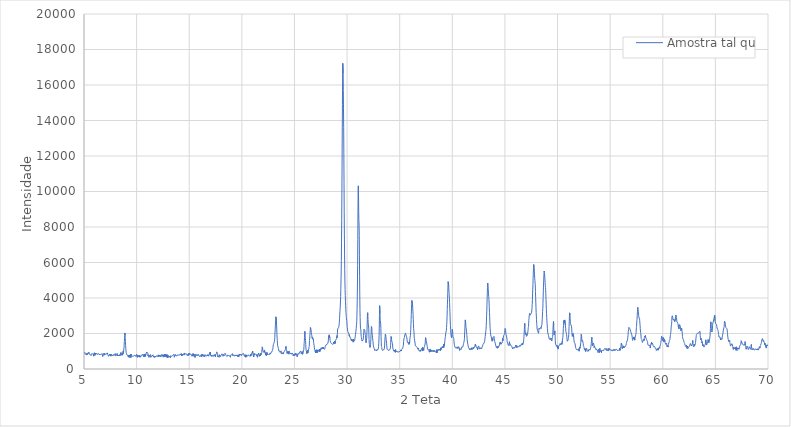
| Category | Amostra tal qual  |
|---|---|
| 2.00071892 | 3446.738 |
| 2.01771892 | 3473.504 |
| 2.03471892 | 3361.648 |
| 2.05171892 | 3457.384 |
| 2.06871892 | 3377.468 |
| 2.08571892 | 3362.294 |
| 2.10271892 | 3392.983 |
| 2.11971892 | 3262.413 |
| 2.13671892 | 3332.459 |
| 2.15371892 | 3360.539 |
| 2.17071892 | 3289.483 |
| 2.18771892 | 3294.757 |
| 2.20471892 | 3306.055 |
| 2.22171892 | 3299.937 |
| 2.23871892 | 3320.487 |
| 2.25571892 | 3243.116 |
| 2.27271892 | 3268.101 |
| 2.28971892 | 3289.063 |
| 2.30671892 | 3279.202 |
| 2.32371892 | 3238.842 |
| 2.34071892 | 3213.155 |
| 2.35771892 | 3211.542 |
| 2.37471892 | 3142.597 |
| 2.39171892 | 3151.229 |
| 2.40871892 | 3247.364 |
| 2.42571892 | 3241.54 |
| 2.44271892 | 3160.416 |
| 2.45971892 | 3089.484 |
| 2.47671892 | 3081.322 |
| 2.49371892 | 3093.118 |
| 2.51071892 | 3058.055 |
| 2.52771892 | 3018.761 |
| 2.54471892 | 3102.33 |
| 2.56171892 | 3078.498 |
| 2.57871892 | 3039.859 |
| 2.59571892 | 3004.997 |
| 2.61271892 | 2956.349 |
| 2.62971892 | 2957.309 |
| 2.64671892 | 2967.222 |
| 2.66371892 | 2911.367 |
| 2.68071892 | 2879.38 |
| 2.69771892 | 2926.047 |
| 2.71471892 | 2830.583 |
| 2.73171892 | 2797.06 |
| 2.74871892 | 2886.039 |
| 2.76571892 | 2718.343 |
| 2.78271892 | 2812.035 |
| 2.79971892 | 2791.457 |
| 2.81671892 | 2711.192 |
| 2.83371892 | 2725.256 |
| 2.85071892 | 2616.702 |
| 2.86771892 | 2642.447 |
| 2.88471892 | 2576.996 |
| 2.90171892 | 2525.166 |
| 2.91871892 | 2532.669 |
| 2.93571892 | 2469.244 |
| 2.95271892 | 2494.887 |
| 2.96971892 | 2457.457 |
| 2.98671892 | 2372.251 |
| 3.00371892 | 2308.032 |
| 3.02071892 | 2289.84 |
| 3.03771892 | 2283.734 |
| 3.05471892 | 2214.18 |
| 3.07171892 | 2116.393 |
| 3.08871892 | 2072.455 |
| 3.10571892 | 2058.463 |
| 3.12271892 | 1905.633 |
| 3.13971892 | 1860.612 |
| 3.15671892 | 1861.411 |
| 3.17371892 | 1893.253 |
| 3.19071892 | 1799.585 |
| 3.20771892 | 1719.695 |
| 3.22471892 | 1781.858 |
| 3.24171892 | 1728.142 |
| 3.25871892 | 1622.046 |
| 3.27571892 | 1722.921 |
| 3.29271892 | 1656.152 |
| 3.30971892 | 1688.199 |
| 3.32671892 | 1601.05 |
| 3.34371892 | 1553.948 |
| 3.36071892 | 1642.398 |
| 3.37771892 | 1640.225 |
| 3.39471892 | 1617.008 |
| 3.41171892 | 1618.382 |
| 3.42871892 | 1604.823 |
| 3.44571892 | 1553.759 |
| 3.46271892 | 1575.585 |
| 3.47971892 | 1619.36 |
| 3.49671892 | 1637.564 |
| 3.51371892 | 1630.763 |
| 3.53071892 | 1586.431 |
| 3.54771892 | 1594.211 |
| 3.56471892 | 1548.388 |
| 3.58171892 | 1483.349 |
| 3.59871892 | 1505.972 |
| 3.61571892 | 1525.682 |
| 3.63271892 | 1544.296 |
| 3.64971892 | 1598.179 |
| 3.66671892 | 1556.754 |
| 3.68371892 | 1529.047 |
| 3.70071892 | 1532.015 |
| 3.71771892 | 1501.546 |
| 3.73471892 | 1580.19 |
| 3.75171892 | 1607.742 |
| 3.76871892 | 1499.635 |
| 3.78571892 | 1511.165 |
| 3.80271892 | 1579.337 |
| 3.81971892 | 1559.485 |
| 3.83671892 | 1436.397 |
| 3.85371892 | 1452.405 |
| 3.87071892 | 1433.265 |
| 3.88771892 | 1552.895 |
| 3.90471892 | 1535.404 |
| 3.92171892 | 1500.08 |
| 3.93871892 | 1471.132 |
| 3.95571892 | 1410.492 |
| 3.97271892 | 1531.072 |
| 3.98971892 | 1406.889 |
| 4.00671892 | 1453.852 |
| 4.02371892 | 1396.467 |
| 4.04071892 | 1399.953 |
| 4.05771892 | 1375.744 |
| 4.07471892 | 1405.099 |
| 4.09171892 | 1416.809 |
| 4.10871892 | 1360.306 |
| 4.12571892 | 1418.059 |
| 4.14271892 | 1356.206 |
| 4.15971892 | 1468.643 |
| 4.17671892 | 1410.128 |
| 4.19371892 | 1326.726 |
| 4.21071892 | 1290.678 |
| 4.22771892 | 1388.231 |
| 4.24471892 | 1381.931 |
| 4.26171892 | 1290.371 |
| 4.27871892 | 1270.621 |
| 4.29571892 | 1268.655 |
| 4.31271892 | 1239.893 |
| 4.32971892 | 1260.798 |
| 4.34671892 | 1277.987 |
| 4.36371892 | 1215.499 |
| 4.38071892 | 1155.62 |
| 4.39771892 | 1172.671 |
| 4.41471892 | 1183.593 |
| 4.43171892 | 1179.382 |
| 4.44871892 | 1183.233 |
| 4.46571892 | 1147.348 |
| 4.48271892 | 1164.806 |
| 4.49971892 | 1195.145 |
| 4.51671892 | 1166.246 |
| 4.53371892 | 1121.716 |
| 4.55071892 | 1056.887 |
| 4.56771892 | 1064.774 |
| 4.58471892 | 1061.372 |
| 4.60171892 | 1095.445 |
| 4.61871892 | 1097.268 |
| 4.63571892 | 1097.293 |
| 4.65271892 | 992.9 |
| 4.66971892 | 971.624 |
| 4.68671892 | 1003.192 |
| 4.70371892 | 948.319 |
| 4.72071892 | 900.871 |
| 4.73771892 | 961.715 |
| 4.75471892 | 959.519 |
| 4.77171892 | 968.579 |
| 4.78871892 | 951.165 |
| 4.80571892 | 953.19 |
| 4.82271892 | 922.912 |
| 4.83971892 | 894.237 |
| 4.85671892 | 875.528 |
| 4.87371892 | 888.968 |
| 4.89071892 | 902.568 |
| 4.90771892 | 901.63 |
| 4.92471892 | 918.729 |
| 4.94171892 | 913.101 |
| 4.95871892 | 817.649 |
| 4.97571892 | 858.803 |
| 4.99271892 | 950.732 |
| 5.00971892 | 906.744 |
| 5.02671892 | 870.139 |
| 5.04371892 | 851.049 |
| 5.06071892 | 847.14 |
| 5.07771892 | 930.862 |
| 5.09471892 | 926.367 |
| 5.11171892 | 847.409 |
| 5.12871892 | 880.678 |
| 5.14571892 | 876.576 |
| 5.16271892 | 801.924 |
| 5.17971892 | 852.382 |
| 5.19671892 | 869.995 |
| 5.21371892 | 793.837 |
| 5.23071892 | 813.814 |
| 5.24771892 | 830.915 |
| 5.26471892 | 862.054 |
| 5.28171892 | 788.378 |
| 5.29871892 | 809.798 |
| 5.31571892 | 905.331 |
| 5.33271892 | 859.448 |
| 5.34971892 | 913.883 |
| 5.36671892 | 865.369 |
| 5.38371892 | 842.615 |
| 5.40071892 | 842.615 |
| 5.41771892 | 848.252 |
| 5.43471892 | 831.962 |
| 5.45171892 | 867.872 |
| 5.46871892 | 953.531 |
| 5.48571892 | 851.681 |
| 5.50271892 | 805.371 |
| 5.51971892 | 903.625 |
| 5.53671892 | 820.633 |
| 5.55371892 | 860.44 |
| 5.57071892 | 827.934 |
| 5.58771892 | 819.183 |
| 5.60471892 | 852.868 |
| 5.62171892 | 811.633 |
| 5.63871892 | 846.485 |
| 5.65571892 | 819.583 |
| 5.67271892 | 755.762 |
| 5.68971892 | 849.071 |
| 5.70671892 | 841.063 |
| 5.72371892 | 821.73 |
| 5.74071892 | 869.597 |
| 5.75771892 | 838.418 |
| 5.77471892 | 846.664 |
| 5.79171892 | 853.175 |
| 5.80871892 | 833.71 |
| 5.82571892 | 873.493 |
| 5.84271892 | 847.031 |
| 5.85971892 | 819.157 |
| 5.87671892 | 862.997 |
| 5.89371892 | 854.391 |
| 5.91071892 | 723.7 |
| 5.92771892 | 814.85 |
| 5.94471892 | 858.653 |
| 5.96171892 | 786.149 |
| 5.97871892 | 766.389 |
| 5.99571892 | 914.376 |
| 6.01271892 | 836.865 |
| 6.02971892 | 764.478 |
| 6.04671892 | 820.298 |
| 6.06371892 | 888.749 |
| 6.08071892 | 826.363 |
| 6.09771892 | 852.899 |
| 6.11471892 | 792.717 |
| 6.13171892 | 831.795 |
| 6.14871892 | 810.141 |
| 6.16571892 | 867.062 |
| 6.18271892 | 891.457 |
| 6.19971892 | 876.4 |
| 6.21671892 | 915.04 |
| 6.23371892 | 919.262 |
| 6.25071892 | 855.328 |
| 6.26771892 | 809.393 |
| 6.28471892 | 812.512 |
| 6.30171892 | 822.481 |
| 6.31871892 | 868.723 |
| 6.33571892 | 867.308 |
| 6.35271892 | 831.501 |
| 6.36971892 | 851.293 |
| 6.38671892 | 853.375 |
| 6.40371892 | 851.337 |
| 6.42071892 | 847.083 |
| 6.43771892 | 823.973 |
| 6.45471892 | 840.749 |
| 6.47171892 | 861.331 |
| 6.48871892 | 837.02 |
| 6.50571892 | 790.082 |
| 6.52271892 | 812.631 |
| 6.53971892 | 812.843 |
| 6.55671892 | 821.459 |
| 6.57371892 | 783.835 |
| 6.59071892 | 848.528 |
| 6.60771892 | 840.426 |
| 6.62471892 | 809.389 |
| 6.64171892 | 830.764 |
| 6.65871892 | 866.025 |
| 6.67571892 | 864.378 |
| 6.69271892 | 848.94 |
| 6.70971892 | 852.036 |
| 6.72671892 | 800.37 |
| 6.74371892 | 818.436 |
| 6.76071892 | 782.196 |
| 6.77771892 | 704.751 |
| 6.79471892 | 780.709 |
| 6.81171892 | 820.762 |
| 6.82871892 | 880.68 |
| 6.84571892 | 879.273 |
| 6.86271892 | 886.779 |
| 6.87971892 | 852.35 |
| 6.89671892 | 847.164 |
| 6.91371892 | 775.266 |
| 6.93071892 | 821.55 |
| 6.94771892 | 880.604 |
| 6.96471892 | 852.349 |
| 6.98171892 | 815.032 |
| 6.99871892 | 832.621 |
| 7.01571892 | 816.482 |
| 7.03271892 | 782.922 |
| 7.04971892 | 774.597 |
| 7.06671892 | 838.753 |
| 7.08371892 | 855.021 |
| 7.10071892 | 806.631 |
| 7.11771892 | 835.157 |
| 7.13471892 | 853.399 |
| 7.15171892 | 842.14 |
| 7.16871892 | 873.305 |
| 7.18571892 | 844.041 |
| 7.20271892 | 832.966 |
| 7.21971892 | 909.667 |
| 7.23671892 | 902.245 |
| 7.25371892 | 828.581 |
| 7.27071892 | 853.766 |
| 7.28771892 | 772.788 |
| 7.30471892 | 818.535 |
| 7.32171892 | 803.77 |
| 7.33871892 | 712.815 |
| 7.35571892 | 750.768 |
| 7.37271892 | 711.728 |
| 7.38971892 | 775.641 |
| 7.40671892 | 800.576 |
| 7.42371892 | 836.31 |
| 7.44071892 | 789.17 |
| 7.45771892 | 793.348 |
| 7.47471892 | 849.407 |
| 7.49171892 | 742.992 |
| 7.50871892 | 796.093 |
| 7.52571892 | 821.698 |
| 7.54271892 | 799.547 |
| 7.55971892 | 726.21 |
| 7.57671892 | 844.982 |
| 7.59371892 | 808.915 |
| 7.61071892 | 794.62 |
| 7.62771892 | 833.736 |
| 7.64471892 | 824.724 |
| 7.66171892 | 788.465 |
| 7.67871892 | 766.634 |
| 7.69571892 | 824.649 |
| 7.71271892 | 780.481 |
| 7.72971892 | 744.197 |
| 7.74671892 | 754.46 |
| 7.76371892 | 738.16 |
| 7.78071892 | 747.836 |
| 7.79771892 | 749.162 |
| 7.81471892 | 719.014 |
| 7.83171892 | 742.565 |
| 7.84871892 | 831.189 |
| 7.86571892 | 824.398 |
| 7.88271892 | 791.357 |
| 7.89971892 | 785.509 |
| 7.91671892 | 770.76 |
| 7.93371892 | 814.82 |
| 7.95071892 | 787.563 |
| 7.96771892 | 863.551 |
| 7.98471892 | 791.876 |
| 8.00171892 | 755.595 |
| 8.01871892 | 792.302 |
| 8.03571892 | 730.379 |
| 8.05271892 | 756.603 |
| 8.06971892 | 781.949 |
| 8.08671892 | 806.362 |
| 8.10371892 | 818.363 |
| 8.12071892 | 776.367 |
| 8.13771892 | 810.025 |
| 8.15471892 | 882.255 |
| 8.17171892 | 805.188 |
| 8.18871892 | 731.684 |
| 8.20571892 | 803.297 |
| 8.22271892 | 813.572 |
| 8.23971892 | 826.771 |
| 8.25671892 | 798.001 |
| 8.27371892 | 796.678 |
| 8.29071892 | 800 |
| 8.30771892 | 733.016 |
| 8.32471892 | 758.77 |
| 8.34171892 | 787.401 |
| 8.35871892 | 755.817 |
| 8.37571892 | 773.573 |
| 8.39271892 | 800 |
| 8.40971892 | 741.102 |
| 8.42671892 | 789.079 |
| 8.44371892 | 832.23 |
| 8.46071892 | 783.955 |
| 8.47771892 | 787.401 |
| 8.49471892 | 847.356 |
| 8.51171892 | 929.426 |
| 8.52871892 | 879.372 |
| 8.54571892 | 774.597 |
| 8.56271892 | 798.094 |
| 8.57971892 | 817.979 |
| 8.59671892 | 760.697 |
| 8.61371892 | 825.043 |
| 8.63071892 | 829.067 |
| 8.64771892 | 885.663 |
| 8.66471892 | 780.952 |
| 8.68171892 | 883.501 |
| 8.69871892 | 921.954 |
| 8.71571892 | 930.803 |
| 8.73271892 | 1016.617 |
| 8.74971892 | 877.226 |
| 8.76671892 | 1029.789 |
| 8.78371892 | 1062.406 |
| 8.80071892 | 1194.358 |
| 8.81771892 | 1397.22 |
| 8.83471892 | 1545.552 |
| 8.85171892 | 1782.956 |
| 8.86871892 | 1896.501 |
| 8.88571892 | 2030.665 |
| 8.90271892 | 1909.949 |
| 8.91971892 | 1728.282 |
| 8.93671892 | 1547.328 |
| 8.95371892 | 1326.877 |
| 8.97071892 | 1157.664 |
| 8.98771892 | 1057.147 |
| 9.00471892 | 936.252 |
| 9.02171892 | 893.812 |
| 9.03871892 | 851.654 |
| 9.05571892 | 849.812 |
| 9.07271892 | 871.78 |
| 9.08971892 | 850.253 |
| 9.10671892 | 824.567 |
| 9.12371892 | 773.367 |
| 9.14071892 | 745.882 |
| 9.15771892 | 796.449 |
| 9.17471892 | 827.067 |
| 9.19171892 | 819.179 |
| 9.20871892 | 745.041 |
| 9.22571892 | 665.38 |
| 9.24271892 | 764.622 |
| 9.25971892 | 795 |
| 9.27671892 | 689.643 |
| 9.29371892 | 775.158 |
| 9.31071892 | 750.936 |
| 9.32771892 | 749.243 |
| 9.34471892 | 788.521 |
| 9.36171892 | 651.2 |
| 9.37871892 | 722.533 |
| 9.39571892 | 743.77 |
| 9.41271892 | 842.615 |
| 9.42971892 | 837.888 |
| 9.44671892 | 648.092 |
| 9.46371892 | 655.57 |
| 9.48071892 | 744.156 |
| 9.49771892 | 824.927 |
| 9.51471892 | 768.633 |
| 9.53171892 | 749.977 |
| 9.54871892 | 754 |
| 9.56571892 | 732.761 |
| 9.58271892 | 705.651 |
| 9.59971892 | 743.037 |
| 9.61671892 | 734.814 |
| 9.63371892 | 707.783 |
| 9.65071892 | 729.423 |
| 9.66771892 | 718.475 |
| 9.68471892 | 725.279 |
| 9.70171892 | 730.578 |
| 9.71871892 | 736.214 |
| 9.73571892 | 741.62 |
| 9.75271892 | 752.668 |
| 9.76971892 | 754.649 |
| 9.78671892 | 734.844 |
| 9.80371892 | 714.493 |
| 9.82071892 | 750.323 |
| 9.83771892 | 783.909 |
| 9.85471892 | 772.002 |
| 9.87171892 | 763.246 |
| 9.88871892 | 744.946 |
| 9.90571892 | 815.725 |
| 9.92271892 | 816.846 |
| 9.93971892 | 696.876 |
| 9.95671892 | 743.376 |
| 9.97371892 | 672.375 |
| 9.99071892 | 672.032 |
| 10.00771892 | 828.315 |
| 10.02471892 | 782.669 |
| 10.04171892 | 749.238 |
| 10.05871892 | 701.521 |
| 10.07571892 | 657.054 |
| 10.09271892 | 760.945 |
| 10.10971892 | 747.716 |
| 10.12671892 | 721.168 |
| 10.14371892 | 707.491 |
| 10.16071892 | 752.555 |
| 10.17771892 | 717.387 |
| 10.19471892 | 701.463 |
| 10.21171892 | 765.481 |
| 10.22871892 | 705.923 |
| 10.24571892 | 692.82 |
| 10.26271892 | 774.311 |
| 10.27971892 | 722.446 |
| 10.29671892 | 726.183 |
| 10.31371892 | 662.539 |
| 10.33071892 | 734.387 |
| 10.34771892 | 729.965 |
| 10.36471892 | 674.353 |
| 10.38171892 | 697.077 |
| 10.39871892 | 757.401 |
| 10.41571892 | 755 |
| 10.43271892 | 749.559 |
| 10.44971892 | 768.386 |
| 10.46671892 | 761.689 |
| 10.48371892 | 722.737 |
| 10.50071892 | 739.479 |
| 10.51771892 | 727.392 |
| 10.53471892 | 699.162 |
| 10.55171892 | 836.201 |
| 10.56871892 | 859.001 |
| 10.58571892 | 789.43 |
| 10.60271892 | 802.959 |
| 10.61971892 | 818.052 |
| 10.63671892 | 775.148 |
| 10.65371892 | 697.557 |
| 10.67071892 | 712.78 |
| 10.68771892 | 715.439 |
| 10.70471892 | 771.984 |
| 10.72171892 | 847.957 |
| 10.73871892 | 702.011 |
| 10.75571892 | 727.767 |
| 10.77271892 | 811.595 |
| 10.78971892 | 792.077 |
| 10.80671892 | 700.643 |
| 10.82371892 | 844.243 |
| 10.84071892 | 735.366 |
| 10.85771892 | 752.814 |
| 10.87471892 | 817.462 |
| 10.89171892 | 819.341 |
| 10.90871892 | 818.535 |
| 10.92571892 | 818.535 |
| 10.94271892 | 861.013 |
| 10.95971892 | 959.788 |
| 10.97671892 | 942.511 |
| 10.99371892 | 1001.735 |
| 11.01071892 | 984.889 |
| 11.02771892 | 988.282 |
| 11.04471892 | 937.023 |
| 11.06171892 | 889.658 |
| 11.07871892 | 737.069 |
| 11.09571892 | 690.175 |
| 11.11271892 | 797.908 |
| 11.12971892 | 782.218 |
| 11.14671892 | 731.26 |
| 11.16371892 | 709.487 |
| 11.18071892 | 660.882 |
| 11.19771892 | 694.557 |
| 11.21471892 | 749.787 |
| 11.23171892 | 731.687 |
| 11.24871892 | 702.113 |
| 11.26571892 | 694.33 |
| 11.28271892 | 711.87 |
| 11.29971892 | 720.421 |
| 11.31671892 | 822.41 |
| 11.33371892 | 733.295 |
| 11.35071892 | 664.01 |
| 11.36771892 | 728.011 |
| 11.38471892 | 732.798 |
| 11.40171892 | 753.244 |
| 11.41871892 | 687.524 |
| 11.43571892 | 706.194 |
| 11.45271892 | 693.958 |
| 11.46971892 | 721.11 |
| 11.48671892 | 721.11 |
| 11.50371892 | 760.162 |
| 11.52071892 | 723.644 |
| 11.53771892 | 688.699 |
| 11.55471892 | 799.292 |
| 11.57171892 | 734.225 |
| 11.58871892 | 732.647 |
| 11.60571892 | 671.208 |
| 11.62271892 | 729.715 |
| 11.63971892 | 717.082 |
| 11.65671892 | 712.307 |
| 11.67371892 | 683.534 |
| 11.69071892 | 729.759 |
| 11.70771892 | 709.733 |
| 11.72471892 | 637.363 |
| 11.74171892 | 731.707 |
| 11.75871892 | 746.83 |
| 11.77571892 | 730.576 |
| 11.79271892 | 737.484 |
| 11.80971892 | 775.693 |
| 11.82671892 | 772.622 |
| 11.84371892 | 681.593 |
| 11.86071892 | 652.847 |
| 11.87771892 | 681.261 |
| 11.89471892 | 688.379 |
| 11.91171892 | 725.943 |
| 11.92871892 | 759.185 |
| 11.94571892 | 707.575 |
| 11.96271892 | 725.111 |
| 11.97971892 | 781.847 |
| 11.99671892 | 742.452 |
| 12.01371892 | 765.681 |
| 12.03071892 | 687.75 |
| 12.04771892 | 737.872 |
| 12.06471892 | 794.255 |
| 12.08171892 | 822.689 |
| 12.09871892 | 701.217 |
| 12.11571892 | 719.181 |
| 12.13271892 | 791.292 |
| 12.14971892 | 721.248 |
| 12.16671892 | 734.641 |
| 12.18371892 | 754.183 |
| 12.20071892 | 773.33 |
| 12.21771892 | 726.112 |
| 12.23471892 | 708.739 |
| 12.25171892 | 771.054 |
| 12.26871892 | 731.384 |
| 12.28571892 | 743.212 |
| 12.30271892 | 688.304 |
| 12.31971892 | 765.896 |
| 12.33671892 | 816.51 |
| 12.35371892 | 793.974 |
| 12.37071892 | 749.768 |
| 12.38771892 | 823.572 |
| 12.40471892 | 847.546 |
| 12.42171892 | 772.401 |
| 12.43871892 | 719.957 |
| 12.45571892 | 729.603 |
| 12.47271892 | 723.433 |
| 12.48971892 | 759.057 |
| 12.50671892 | 812.191 |
| 12.52371892 | 757.569 |
| 12.54071892 | 668.6 |
| 12.55771892 | 715.171 |
| 12.57471892 | 791.314 |
| 12.59171892 | 782.852 |
| 12.60871892 | 746.215 |
| 12.62571892 | 703.245 |
| 12.64271892 | 773.244 |
| 12.65971892 | 833.265 |
| 12.67671892 | 769.552 |
| 12.69371892 | 742.71 |
| 12.71071892 | 840.519 |
| 12.72771892 | 707.548 |
| 12.74471892 | 671.797 |
| 12.76171892 | 693.691 |
| 12.77871892 | 804.395 |
| 12.79571892 | 708.29 |
| 12.81271892 | 728.222 |
| 12.82971892 | 735.228 |
| 12.84671892 | 798.78 |
| 12.86371892 | 662.849 |
| 12.88071892 | 690.3 |
| 12.89771892 | 730.965 |
| 12.91471892 | 697.995 |
| 12.93171892 | 801.524 |
| 12.94871892 | 813.45 |
| 12.96571892 | 634.418 |
| 12.98271892 | 757.553 |
| 12.99971892 | 720.609 |
| 13.01671892 | 713.566 |
| 13.03371892 | 735.615 |
| 13.05071892 | 741.62 |
| 13.06771892 | 737.197 |
| 13.08471892 | 699.773 |
| 13.10171892 | 664.744 |
| 13.11871892 | 668.852 |
| 13.13571892 | 694.367 |
| 13.15271892 | 721.901 |
| 13.16971892 | 724.498 |
| 13.18671892 | 707.413 |
| 13.20371892 | 635.524 |
| 13.22071892 | 631.239 |
| 13.23771892 | 738.999 |
| 13.25471892 | 737.257 |
| 13.27171892 | 694.522 |
| 13.28871892 | 715.72 |
| 13.30571892 | 792.4 |
| 13.32271892 | 756.476 |
| 13.33971892 | 708.889 |
| 13.35671892 | 707.751 |
| 13.37371892 | 697.258 |
| 13.39071892 | 745.191 |
| 13.40771892 | 755.57 |
| 13.42471892 | 728.98 |
| 13.44171892 | 777.109 |
| 13.45871892 | 743.167 |
| 13.47571892 | 759.886 |
| 13.49271892 | 729.819 |
| 13.50971892 | 793.765 |
| 13.52671892 | 823.897 |
| 13.54371892 | 830.368 |
| 13.56071892 | 760.848 |
| 13.57771892 | 666.248 |
| 13.59471892 | 688.32 |
| 13.61171892 | 686.654 |
| 13.62871892 | 642.041 |
| 13.64571892 | 709.964 |
| 13.66271892 | 700.883 |
| 13.67971892 | 812.427 |
| 13.69671892 | 767.783 |
| 13.71371892 | 767.461 |
| 13.73071892 | 750.175 |
| 13.74771892 | 703.221 |
| 13.76471892 | 754.942 |
| 13.78171892 | 774.613 |
| 13.79871892 | 750.179 |
| 13.81571892 | 737.907 |
| 13.83271892 | 734.847 |
| 13.84971892 | 758.244 |
| 13.86671892 | 771.869 |
| 13.88371892 | 796.154 |
| 13.90071892 | 805.699 |
| 13.91771892 | 777.122 |
| 13.93471892 | 776.304 |
| 13.95171892 | 751.258 |
| 13.96871892 | 778.952 |
| 13.98571892 | 784.162 |
| 14.00271892 | 806.226 |
| 14.01971892 | 798.499 |
| 14.03671892 | 770.269 |
| 14.05371892 | 754.983 |
| 14.07071892 | 759.543 |
| 14.08771892 | 781.025 |
| 14.10471892 | 783.373 |
| 14.12171892 | 793.894 |
| 14.13871892 | 743.153 |
| 14.15571892 | 841.776 |
| 14.17271892 | 824.087 |
| 14.18971892 | 800.078 |
| 14.20671892 | 800 |
| 14.22371892 | 782.049 |
| 14.24071892 | 870.316 |
| 14.25771892 | 797.203 |
| 14.27471892 | 735.921 |
| 14.29171892 | 710.361 |
| 14.30871892 | 844.685 |
| 14.32571892 | 834.457 |
| 14.34271892 | 815.219 |
| 14.35971892 | 760.238 |
| 14.37671892 | 779.522 |
| 14.39371892 | 784.913 |
| 14.41071892 | 793.797 |
| 14.42771892 | 843.202 |
| 14.44471892 | 836.887 |
| 14.46171892 | 829.37 |
| 14.47871892 | 783.897 |
| 14.49571892 | 745.285 |
| 14.51271892 | 833.758 |
| 14.52971892 | 902.803 |
| 14.54671892 | 859.977 |
| 14.56371892 | 804.155 |
| 14.58071892 | 819.718 |
| 14.59771892 | 847.45 |
| 14.61471892 | 795.959 |
| 14.63171892 | 765.095 |
| 14.64871892 | 850.152 |
| 14.66571892 | 860.921 |
| 14.68271892 | 861.103 |
| 14.69971892 | 882.085 |
| 14.71671892 | 850.359 |
| 14.73371892 | 867.522 |
| 14.75071892 | 827.677 |
| 14.76771892 | 844.313 |
| 14.78471892 | 850.938 |
| 14.80171892 | 817.26 |
| 14.81871892 | 745.726 |
| 14.83571892 | 800.267 |
| 14.85271892 | 806.226 |
| 14.86971892 | 806.226 |
| 14.88671892 | 852.874 |
| 14.90371892 | 761.072 |
| 14.92071892 | 862.71 |
| 14.93771892 | 762.615 |
| 14.95471892 | 866.451 |
| 14.97171892 | 803.306 |
| 14.98871892 | 822.906 |
| 15.00571892 | 844.837 |
| 15.02271892 | 853.033 |
| 15.03971892 | 888.434 |
| 15.05671892 | 829.592 |
| 15.07371892 | 854.318 |
| 15.09071892 | 850.513 |
| 15.10771892 | 874.128 |
| 15.12471892 | 869.993 |
| 15.14171892 | 847.458 |
| 15.15871892 | 839.252 |
| 15.17571892 | 803.706 |
| 15.19271892 | 787.793 |
| 15.20971892 | 838.896 |
| 15.22671892 | 850.574 |
| 15.24371892 | 779.988 |
| 15.26071892 | 719.409 |
| 15.27771892 | 747.32 |
| 15.29471892 | 787.918 |
| 15.31171892 | 757.23 |
| 15.32871892 | 769.794 |
| 15.34571892 | 812.728 |
| 15.36271892 | 880.83 |
| 15.37971892 | 858.055 |
| 15.39671892 | 723.559 |
| 15.41371892 | 835.054 |
| 15.43071892 | 774.597 |
| 15.44771892 | 780.844 |
| 15.46471892 | 813.658 |
| 15.48171892 | 771.157 |
| 15.49871892 | 741.299 |
| 15.51571892 | 831.355 |
| 15.53271892 | 846.177 |
| 15.54971892 | 650.806 |
| 15.56671892 | 800.94 |
| 15.58371892 | 829.167 |
| 15.60071892 | 846.986 |
| 15.61771892 | 805.594 |
| 15.63471892 | 836.889 |
| 15.65171892 | 827.571 |
| 15.66871892 | 829.532 |
| 15.68571892 | 756.244 |
| 15.70271892 | 784.996 |
| 15.71971892 | 795.38 |
| 15.73671892 | 737.945 |
| 15.75371892 | 714.143 |
| 15.77071892 | 780.553 |
| 15.78771892 | 804.529 |
| 15.80471892 | 764.828 |
| 15.82171892 | 737.656 |
| 15.83871892 | 746.217 |
| 15.85571892 | 769.057 |
| 15.87271892 | 781.025 |
| 15.88971892 | 817.508 |
| 15.90671892 | 784.078 |
| 15.92371892 | 753.097 |
| 15.94071892 | 786.384 |
| 15.95771892 | 720.023 |
| 15.97471892 | 753.98 |
| 15.99171892 | 793.498 |
| 16.00871892 | 705.401 |
| 16.02571892 | 683.483 |
| 16.04271892 | 699 |
| 16.05971892 | 767.328 |
| 16.07671892 | 799.694 |
| 16.09371892 | 767.41 |
| 16.11071892 | 745.626 |
| 16.12771892 | 794.095 |
| 16.14471892 | 760.036 |
| 16.16171892 | 790.998 |
| 16.17871892 | 694.139 |
| 16.19571892 | 815.828 |
| 16.21271892 | 735.515 |
| 16.22971892 | 805.121 |
| 16.24671892 | 731.406 |
| 16.26371892 | 759.394 |
| 16.28071892 | 802.243 |
| 16.29771892 | 743.524 |
| 16.31471892 | 769.088 |
| 16.33171892 | 779.956 |
| 16.34871892 | 765.349 |
| 16.36571892 | 745.997 |
| 16.38271892 | 741.62 |
| 16.39971892 | 798.703 |
| 16.41671892 | 681.756 |
| 16.43371892 | 694.533 |
| 16.45071892 | 750.247 |
| 16.46771892 | 769.835 |
| 16.48471892 | 774.597 |
| 16.50171892 | 811.3 |
| 16.51871892 | 792.209 |
| 16.53571892 | 733.545 |
| 16.55271892 | 685.172 |
| 16.56971892 | 677.42 |
| 16.58671892 | 728.757 |
| 16.60371892 | 772.824 |
| 16.62071892 | 744.977 |
| 16.63771892 | 724.434 |
| 16.65471892 | 759.333 |
| 16.67171892 | 713.995 |
| 16.68871892 | 740.668 |
| 16.70571892 | 732.461 |
| 16.72271892 | 806.506 |
| 16.73971892 | 821.838 |
| 16.75671892 | 742.821 |
| 16.77371892 | 737.186 |
| 16.79071892 | 803.333 |
| 16.80771892 | 781.596 |
| 16.82471892 | 754.255 |
| 16.84171892 | 844.052 |
| 16.85871892 | 719.873 |
| 16.87571892 | 812.404 |
| 16.89271892 | 812.263 |
| 16.90971892 | 781.682 |
| 16.92671892 | 851.188 |
| 16.94371892 | 896.85 |
| 16.96071892 | 826.693 |
| 16.97771892 | 818.535 |
| 16.99471892 | 957.932 |
| 17.01171892 | 843.421 |
| 17.02871892 | 822.237 |
| 17.04571892 | 810.335 |
| 17.06271892 | 727.629 |
| 17.07971892 | 778.806 |
| 17.09671892 | 756.731 |
| 17.11371892 | 730.218 |
| 17.13071892 | 745.736 |
| 17.14771892 | 787.55 |
| 17.16471892 | 698.024 |
| 17.18171892 | 657.263 |
| 17.19871892 | 736.097 |
| 17.21571892 | 760.855 |
| 17.23271892 | 744.967 |
| 17.24971892 | 735.156 |
| 17.26671892 | 752.445 |
| 17.28371892 | 805.255 |
| 17.30071892 | 792.243 |
| 17.31771892 | 718.493 |
| 17.33471892 | 754.847 |
| 17.35171892 | 798.46 |
| 17.36871892 | 755.716 |
| 17.38571892 | 792.649 |
| 17.40271892 | 804.666 |
| 17.41971892 | 782.852 |
| 17.43671892 | 740.372 |
| 17.45371892 | 818.876 |
| 17.47071892 | 824.177 |
| 17.48771892 | 687.485 |
| 17.50471892 | 792.456 |
| 17.52171892 | 782.474 |
| 17.53871892 | 799.054 |
| 17.55571892 | 780.376 |
| 17.57271892 | 755.01 |
| 17.58971892 | 869.062 |
| 17.60671892 | 964.883 |
| 17.62371892 | 969.536 |
| 17.64071892 | 964.885 |
| 17.65771892 | 913.119 |
| 17.67471892 | 924.112 |
| 17.69171892 | 867.653 |
| 17.70871892 | 821.003 |
| 17.72571892 | 688.611 |
| 17.74271892 | 749.888 |
| 17.75971892 | 738.132 |
| 17.77671892 | 744.946 |
| 17.79371892 | 789.876 |
| 17.81071892 | 773.373 |
| 17.82771892 | 734.044 |
| 17.84471892 | 655.919 |
| 17.86171892 | 724.435 |
| 17.87871892 | 800 |
| 17.89571892 | 728.108 |
| 17.91271892 | 744.652 |
| 17.92971892 | 771.281 |
| 17.94671892 | 713.412 |
| 17.96371892 | 726.948 |
| 17.98071892 | 698.794 |
| 17.99771892 | 698.729 |
| 18.01471892 | 782.977 |
| 18.03171892 | 786.979 |
| 18.04871892 | 810.573 |
| 18.06571892 | 811.272 |
| 18.08271892 | 809.51 |
| 18.09971892 | 783.119 |
| 18.11671892 | 854.4 |
| 18.13371892 | 845.313 |
| 18.15071892 | 803.654 |
| 18.16771892 | 831.949 |
| 18.18471892 | 875.511 |
| 18.20171892 | 794.644 |
| 18.21871892 | 722.706 |
| 18.23571892 | 756.232 |
| 18.25271892 | 812.174 |
| 18.26971892 | 812.404 |
| 18.28671892 | 812.404 |
| 18.30371892 | 741.308 |
| 18.32071892 | 740.914 |
| 18.33771892 | 753.264 |
| 18.35471892 | 743.704 |
| 18.37171892 | 810.316 |
| 18.38871892 | 824.621 |
| 18.40571892 | 887.571 |
| 18.42271892 | 905.539 |
| 18.43971892 | 864.89 |
| 18.45671892 | 823.606 |
| 18.47371892 | 840.75 |
| 18.49071892 | 766.974 |
| 18.50771892 | 768.439 |
| 18.52471892 | 814.717 |
| 18.54171892 | 803.654 |
| 18.55871892 | 807.857 |
| 18.57571892 | 769.29 |
| 18.59271892 | 700.181 |
| 18.60971892 | 738.221 |
| 18.62671892 | 779.633 |
| 18.64371892 | 796.483 |
| 18.66071892 | 801.966 |
| 18.67771892 | 729.82 |
| 18.69471892 | 730.562 |
| 18.71171892 | 756.78 |
| 18.72871892 | 761.252 |
| 18.74571892 | 733.506 |
| 18.76271892 | 761.188 |
| 18.77971892 | 791.803 |
| 18.79671892 | 766.612 |
| 18.81371892 | 781.002 |
| 18.83071892 | 753.065 |
| 18.84771892 | 778.774 |
| 18.86471892 | 762.783 |
| 18.88171892 | 769.838 |
| 18.89871892 | 698.21 |
| 18.91571892 | 657.892 |
| 18.93271892 | 773.663 |
| 18.94971892 | 762.019 |
| 18.96671892 | 791.874 |
| 18.98371892 | 822.076 |
| 19.00071892 | 813.744 |
| 19.01771892 | 801.674 |
| 19.03471892 | 794.727 |
| 19.05171892 | 819.016 |
| 19.06871892 | 824.621 |
| 19.08571892 | 801.077 |
| 19.10271892 | 865.138 |
| 19.11971892 | 808.761 |
| 19.13671892 | 747.388 |
| 19.15371892 | 711.861 |
| 19.17071892 | 765.503 |
| 19.18771892 | 811.447 |
| 19.20471892 | 803.996 |
| 19.22171892 | 757.322 |
| 19.23871892 | 767.69 |
| 19.25571892 | 790.296 |
| 19.27271892 | 765.202 |
| 19.28971892 | 719.876 |
| 19.30671892 | 713.806 |
| 19.32371892 | 708.549 |
| 19.34071892 | 716.471 |
| 19.35771892 | 794.291 |
| 19.37471892 | 745.851 |
| 19.39171892 | 746.346 |
| 19.40871892 | 792.636 |
| 19.42571892 | 739.842 |
| 19.44271892 | 733.224 |
| 19.45971892 | 738.186 |
| 19.47671892 | 779.436 |
| 19.49371892 | 793.868 |
| 19.51071892 | 767.884 |
| 19.52771892 | 809.712 |
| 19.54471892 | 828.244 |
| 19.56171892 | 739.507 |
| 19.57871892 | 802.511 |
| 19.59571892 | 701.049 |
| 19.61271892 | 780.036 |
| 19.62971892 | 805.283 |
| 19.64671892 | 713.766 |
| 19.66371892 | 797.979 |
| 19.68071892 | 760.963 |
| 19.69771892 | 749.256 |
| 19.71471892 | 708.129 |
| 19.73171892 | 766.397 |
| 19.74871892 | 755.438 |
| 19.76571892 | 722.456 |
| 19.78271892 | 846.223 |
| 19.79971892 | 860.369 |
| 19.81671892 | 767.915 |
| 19.83371892 | 728.011 |
| 19.85071892 | 719.227 |
| 19.86771892 | 763.715 |
| 19.88471892 | 822.698 |
| 19.90171892 | 805.214 |
| 19.91871892 | 840.854 |
| 19.93571892 | 810.667 |
| 19.95271892 | 750.764 |
| 19.96971892 | 789.807 |
| 19.98671892 | 772.351 |
| 20.00371892 | 737.629 |
| 20.02071892 | 744.208 |
| 20.03771892 | 776.614 |
| 20.05471892 | 850.564 |
| 20.07171892 | 882.655 |
| 20.08871892 | 839.237 |
| 20.10571892 | 849.163 |
| 20.12271892 | 872.289 |
| 20.13971892 | 798.484 |
| 20.15671892 | 877.962 |
| 20.17371892 | 844.133 |
| 20.19071892 | 792.468 |
| 20.20771892 | 824.621 |
| 20.22471892 | 822.6 |
| 20.24171892 | 798.91 |
| 20.25871892 | 778.91 |
| 20.27571892 | 713.977 |
| 20.29271892 | 693.193 |
| 20.30971892 | 807.701 |
| 20.32671892 | 701.526 |
| 20.34371892 | 699.339 |
| 20.36071892 | 783.28 |
| 20.37771892 | 664.386 |
| 20.39471892 | 742.604 |
| 20.41171892 | 777.31 |
| 20.42871892 | 800.797 |
| 20.44571892 | 815.559 |
| 20.46271892 | 728.683 |
| 20.47971892 | 677.35 |
| 20.49671892 | 719.824 |
| 20.51371892 | 741.62 |
| 20.53071892 | 733.059 |
| 20.54771892 | 719.637 |
| 20.56471892 | 730.234 |
| 20.58171892 | 745.358 |
| 20.59871892 | 793.099 |
| 20.61571892 | 786.893 |
| 20.63271892 | 744.853 |
| 20.64971892 | 748.331 |
| 20.66671892 | 745.45 |
| 20.68371892 | 741.62 |
| 20.70071892 | 749.27 |
| 20.71771892 | 768.539 |
| 20.73471892 | 795.673 |
| 20.75171892 | 804.032 |
| 20.76871892 | 760.521 |
| 20.78571892 | 749.538 |
| 20.80271892 | 713.913 |
| 20.81971892 | 817.998 |
| 20.83671892 | 733.953 |
| 20.85371892 | 827.9 |
| 20.87071892 | 876.761 |
| 20.88771892 | 860.98 |
| 20.90471892 | 769.304 |
| 20.92171892 | 854.086 |
| 20.93871892 | 850.382 |
| 20.95571892 | 911.043 |
| 20.97271892 | 911.043 |
| 20.98971892 | 911.043 |
| 21.00671892 | 965.454 |
| 21.02371892 | 1010.583 |
| 21.04071892 | 890.474 |
| 21.05771892 | 900.651 |
| 21.07471892 | 788.249 |
| 21.09171892 | 827.252 |
| 21.10871892 | 819.221 |
| 21.12571892 | 675.9 |
| 21.14271892 | 721.747 |
| 21.15971892 | 871.55 |
| 21.17671892 | 802.27 |
| 21.19371892 | 828.807 |
| 21.21071892 | 812.217 |
| 21.22771892 | 830.824 |
| 21.24471892 | 818.086 |
| 21.26171892 | 795.024 |
| 21.27871892 | 853.797 |
| 21.29571892 | 868.837 |
| 21.31271892 | 853.844 |
| 21.32971892 | 828.759 |
| 21.34671892 | 802.547 |
| 21.36371892 | 793.639 |
| 21.38071892 | 742.478 |
| 21.39771892 | 747.983 |
| 21.41471892 | 732.628 |
| 21.43171892 | 752.368 |
| 21.44871892 | 813.028 |
| 21.46571892 | 793.686 |
| 21.48271892 | 665.767 |
| 21.49971892 | 675.283 |
| 21.51671892 | 772.335 |
| 21.53371892 | 772.322 |
| 21.55071892 | 819.325 |
| 21.56771892 | 733.49 |
| 21.58471892 | 736.444 |
| 21.60171892 | 902.534 |
| 21.61871892 | 842.903 |
| 21.63571892 | 854.391 |
| 21.65271892 | 795.358 |
| 21.66971892 | 711.784 |
| 21.68671892 | 745.272 |
| 21.70371892 | 742.302 |
| 21.72071892 | 803.803 |
| 21.73771892 | 735.668 |
| 21.75471892 | 797.043 |
| 21.77171892 | 831.824 |
| 21.78871892 | 890.384 |
| 21.80571892 | 893.061 |
| 21.82271892 | 798.859 |
| 21.83971892 | 818.976 |
| 21.85671892 | 858.435 |
| 21.87371892 | 873.472 |
| 21.89071892 | 939.179 |
| 21.90771892 | 992.898 |
| 21.92471892 | 1155.951 |
| 21.94171892 | 1246.05 |
| 21.95871892 | 1204.859 |
| 21.97571892 | 1149.07 |
| 21.99271892 | 1070.863 |
| 22.00971892 | 1001.064 |
| 22.02671892 | 1021.396 |
| 22.04371892 | 1025.031 |
| 22.06071892 | 972.038 |
| 22.07771892 | 934.358 |
| 22.09471892 | 884.961 |
| 22.11171892 | 967.255 |
| 22.12871892 | 958.871 |
| 22.14571892 | 1072.457 |
| 22.16271892 | 1055.166 |
| 22.17971892 | 1021.291 |
| 22.19671892 | 922.879 |
| 22.21371892 | 918.694 |
| 22.23071892 | 861.846 |
| 22.24771892 | 837.514 |
| 22.26471892 | 892.566 |
| 22.28171892 | 794.234 |
| 22.29871892 | 926.287 |
| 22.31571892 | 872.077 |
| 22.33271892 | 745.897 |
| 22.34971892 | 820.242 |
| 22.36671892 | 873.358 |
| 22.38371892 | 819.523 |
| 22.40071892 | 922.626 |
| 22.41771892 | 924.486 |
| 22.43471892 | 818.419 |
| 22.45171892 | 870.075 |
| 22.46871892 | 821.386 |
| 22.48571892 | 836.36 |
| 22.50271892 | 865.3 |
| 22.51971892 | 843.478 |
| 22.53671892 | 814.41 |
| 22.55371892 | 825.932 |
| 22.57071892 | 847.671 |
| 22.58771892 | 800.649 |
| 22.60471892 | 772.683 |
| 22.62171892 | 759.887 |
| 22.63871892 | 814.803 |
| 22.65571892 | 863.347 |
| 22.67271892 | 899.35 |
| 22.68971892 | 925.694 |
| 22.70671892 | 869.836 |
| 22.72371892 | 840.284 |
| 22.74071892 | 885.681 |
| 22.75771892 | 931.903 |
| 22.77471892 | 889.49 |
| 22.79171892 | 953.507 |
| 22.80871892 | 985.901 |
| 22.82571892 | 964.716 |
| 22.84271892 | 938.521 |
| 22.85971892 | 965.132 |
| 22.87671892 | 997.477 |
| 22.89371892 | 1043.913 |
| 22.91071892 | 1088.338 |
| 22.92771892 | 1006.341 |
| 22.94471892 | 1120.913 |
| 22.96171892 | 1221.655 |
| 22.97871892 | 1247.113 |
| 22.99571892 | 1373.592 |
| 23.01271892 | 1360.657 |
| 23.02971892 | 1434.173 |
| 23.04671892 | 1396.794 |
| 23.06371892 | 1467.517 |
| 23.08071892 | 1440.906 |
| 23.09771892 | 1553.292 |
| 23.11471892 | 1653.044 |
| 23.13171892 | 1764.576 |
| 23.14871892 | 2042.274 |
| 23.16571892 | 2198.247 |
| 23.18271892 | 2416.306 |
| 23.19971892 | 2588.43 |
| 23.21671892 | 2798.766 |
| 23.23371892 | 2939.628 |
| 23.25071892 | 2985.575 |
| 23.26771892 | 2905.501 |
| 23.28471892 | 2714.749 |
| 23.30171892 | 2473.855 |
| 23.31871892 | 2206.355 |
| 23.33571892 | 1931.949 |
| 23.35271892 | 1740.084 |
| 23.36971892 | 1605.355 |
| 23.38671892 | 1412.926 |
| 23.40371892 | 1306.972 |
| 23.42071892 | 1312.946 |
| 23.43771892 | 1243.426 |
| 23.45471892 | 1197.914 |
| 23.47171892 | 1152.505 |
| 23.48871892 | 1116.787 |
| 23.50571892 | 1136.768 |
| 23.52271892 | 1010.249 |
| 23.53971892 | 1017.691 |
| 23.55671892 | 971.889 |
| 23.57371892 | 1004.52 |
| 23.59071892 | 969.536 |
| 23.60771892 | 973.1 |
| 23.62471892 | 1005.379 |
| 23.64171892 | 934.1 |
| 23.65871892 | 968.669 |
| 23.67571892 | 889.992 |
| 23.69271892 | 894.209 |
| 23.70971892 | 945.298 |
| 23.72671892 | 1022.606 |
| 23.74371892 | 871.134 |
| 23.76071892 | 843.442 |
| 23.77771892 | 852.472 |
| 23.79471892 | 931.535 |
| 23.81171892 | 906.354 |
| 23.82871892 | 850.875 |
| 23.84571892 | 887.807 |
| 23.86271892 | 893.702 |
| 23.87971892 | 892.663 |
| 23.89671892 | 916.286 |
| 23.91371892 | 870.901 |
| 23.93071892 | 836.66 |
| 23.94771892 | 870.882 |
| 23.96471892 | 897.548 |
| 23.98171892 | 940.627 |
| 23.99871892 | 977.287 |
| 24.01571892 | 931.695 |
| 24.03271892 | 925.837 |
| 24.04971892 | 961.927 |
| 24.06671892 | 942.429 |
| 24.08371892 | 970.661 |
| 24.10071892 | 1033.121 |
| 24.11771892 | 1081.665 |
| 24.13471892 | 1100.027 |
| 24.15171892 | 1142.655 |
| 24.16871892 | 1182.109 |
| 24.18571892 | 1272.792 |
| 24.20271892 | 1253.055 |
| 24.21971892 | 1158.297 |
| 24.23671892 | 1087.474 |
| 24.25371892 | 1118.626 |
| 24.27071892 | 1109.036 |
| 24.28771892 | 980.776 |
| 24.30471892 | 878.626 |
| 24.32171892 | 983.749 |
| 24.33871892 | 948.575 |
| 24.35571892 | 933.032 |
| 24.37271892 | 937.852 |
| 24.38971892 | 881.778 |
| 24.40671892 | 892.856 |
| 24.42371892 | 951.712 |
| 24.44071892 | 840.209 |
| 24.45771892 | 877.343 |
| 24.47471892 | 1003.8 |
| 24.49171892 | 921.502 |
| 24.50871892 | 871.648 |
| 24.52571892 | 903.194 |
| 24.54271892 | 924.181 |
| 24.55971892 | 854.82 |
| 24.57671892 | 849.956 |
| 24.59371892 | 817.357 |
| 24.61071892 | 839.473 |
| 24.62771892 | 820.366 |
| 24.64471892 | 855.614 |
| 24.66171892 | 902.279 |
| 24.67871892 | 856.967 |
| 24.69571892 | 830.17 |
| 24.71271892 | 863.919 |
| 24.72971892 | 881.544 |
| 24.74671892 | 871.78 |
| 24.76371892 | 884.73 |
| 24.78071892 | 905.539 |
| 24.79771892 | 907.353 |
| 24.81471892 | 899.296 |
| 24.83171892 | 870.18 |
| 24.84871892 | 858.674 |
| 24.86571892 | 815.922 |
| 24.88271892 | 757.894 |
| 24.89971892 | 830.426 |
| 24.91671892 | 878.83 |
| 24.93371892 | 851.398 |
| 24.95071892 | 834.988 |
| 24.96771892 | 861.453 |
| 24.98471892 | 734.857 |
| 25.00171892 | 847.226 |
| 25.01871892 | 800.016 |
| 25.03571892 | 806.085 |
| 25.05271892 | 890.416 |
| 25.06971892 | 868.125 |
| 25.08671892 | 866.025 |
| 25.10371892 | 881.084 |
| 25.12071892 | 780.79 |
| 25.13771892 | 877.581 |
| 25.15471892 | 882.006 |
| 25.17171892 | 903.654 |
| 25.18871892 | 902.758 |
| 25.20571892 | 887.813 |
| 25.22271892 | 859.028 |
| 25.23971892 | 790.79 |
| 25.25671892 | 694.518 |
| 25.27371892 | 809.511 |
| 25.29071892 | 814.766 |
| 25.30771892 | 791.234 |
| 25.32471892 | 868.096 |
| 25.34171892 | 913.922 |
| 25.35871892 | 877.472 |
| 25.37571892 | 842.321 |
| 25.39271892 | 882.333 |
| 25.40971892 | 864.872 |
| 25.42671892 | 825.819 |
| 25.44371892 | 897.213 |
| 25.46071892 | 897.51 |
| 25.47771892 | 899.268 |
| 25.49471892 | 964.863 |
| 25.51171892 | 968.943 |
| 25.52871892 | 917.857 |
| 25.54571892 | 947.591 |
| 25.56271892 | 975.725 |
| 25.57971892 | 968.189 |
| 25.59671892 | 1002.557 |
| 25.61371892 | 959.166 |
| 25.63071892 | 949.353 |
| 25.64771892 | 852.248 |
| 25.66471892 | 827.84 |
| 25.68171892 | 887.773 |
| 25.69871892 | 842.704 |
| 25.71571892 | 898.5 |
| 25.73271892 | 985.467 |
| 25.74971892 | 902.161 |
| 25.76671892 | 826.619 |
| 25.78371892 | 875.206 |
| 25.80071892 | 828.72 |
| 25.81771892 | 931.326 |
| 25.83471892 | 937.075 |
| 25.85171892 | 965.284 |
| 25.86871892 | 935.572 |
| 25.88571892 | 1090.555 |
| 25.90271892 | 1250.556 |
| 25.91971892 | 1432.787 |
| 25.93671892 | 1545.548 |
| 25.95371892 | 1784.58 |
| 25.97071892 | 2043.194 |
| 25.98771892 | 2118.292 |
| 26.00471892 | 1998.034 |
| 26.02171892 | 1814.313 |
| 26.03871892 | 1707.515 |
| 26.05571892 | 1602.158 |
| 26.07271892 | 1392.505 |
| 26.08971892 | 1181.942 |
| 26.10671892 | 1058.724 |
| 26.12371892 | 1003.697 |
| 26.14071892 | 1006.526 |
| 26.15771892 | 959.141 |
| 26.17471892 | 862.611 |
| 26.19171892 | 883.909 |
| 26.20871892 | 959.166 |
| 26.22571892 | 962.597 |
| 26.24271892 | 1000.304 |
| 26.25971892 | 1068.73 |
| 26.27671892 | 914.329 |
| 26.29371892 | 991.985 |
| 26.31071892 | 979.205 |
| 26.32771892 | 1066.089 |
| 26.34471892 | 1047.816 |
| 26.36171892 | 1128.45 |
| 26.37871892 | 1203.694 |
| 26.39571892 | 1282.082 |
| 26.41271892 | 1352.507 |
| 26.42971892 | 1604.606 |
| 26.44671892 | 1692.139 |
| 26.46371892 | 1870.23 |
| 26.48071892 | 2002.888 |
| 26.49771892 | 2168.758 |
| 26.51471892 | 2334.638 |
| 26.53171892 | 2357.171 |
| 26.54871892 | 2265.286 |
| 26.56571892 | 2237.041 |
| 26.58271892 | 2191.406 |
| 26.59971892 | 2064.672 |
| 26.61671892 | 1959.822 |
| 26.63371892 | 1910.438 |
| 26.65071892 | 1883.273 |
| 26.66771892 | 1796.257 |
| 26.68471892 | 1733.373 |
| 26.70171892 | 1799.357 |
| 26.71871892 | 1805.116 |
| 26.73571892 | 1802.939 |
| 26.75271892 | 1842.861 |
| 26.76971892 | 1824.134 |
| 26.78671892 | 1785.59 |
| 26.80371892 | 1635.246 |
| 26.82071892 | 1489.353 |
| 26.83771892 | 1415.327 |
| 26.85471892 | 1361.556 |
| 26.87171892 | 1304.74 |
| 26.88871892 | 1192.275 |
| 26.90571892 | 1152.39 |
| 26.92271892 | 1171.714 |
| 26.93971892 | 1051.296 |
| 26.95671892 | 991.363 |
| 26.97371892 | 997.698 |
| 26.99071892 | 977.501 |
| 27.00771892 | 950.54 |
| 27.02471892 | 907.237 |
| 27.04171892 | 1066.483 |
| 27.05871892 | 980.767 |
| 27.07571892 | 908.293 |
| 27.09271892 | 1049.648 |
| 27.10971892 | 924.615 |
| 27.12671892 | 1084.759 |
| 27.14371892 | 906.983 |
| 27.16071892 | 988.979 |
| 27.17771892 | 943.3 |
| 27.19471892 | 1069.522 |
| 27.21171892 | 1072.982 |
| 27.22871892 | 1002.24 |
| 27.24571892 | 1060.208 |
| 27.26271892 | 1055.608 |
| 27.27971892 | 1045.591 |
| 27.29671892 | 1014.806 |
| 27.31371892 | 988.81 |
| 27.33071892 | 1017.175 |
| 27.34771892 | 1055.345 |
| 27.36471892 | 1126.494 |
| 27.38171892 | 1095.755 |
| 27.39871892 | 965.687 |
| 27.41571892 | 928.628 |
| 27.43271892 | 953.279 |
| 27.44971892 | 961.311 |
| 27.46671892 | 1024.651 |
| 27.48371892 | 1137.653 |
| 27.50071892 | 1176.124 |
| 27.51771892 | 1170.47 |
| 27.53471892 | 1189.882 |
| 27.55171892 | 1202.663 |
| 27.56871892 | 1117.043 |
| 27.58571892 | 1177.66 |
| 27.60271892 | 1200.293 |
| 27.61971892 | 1185.931 |
| 27.63671892 | 1188.637 |
| 27.65371892 | 1125.9 |
| 27.67071892 | 1220.656 |
| 27.68771892 | 1215.202 |
| 27.70471892 | 1128.976 |
| 27.72171892 | 1183.646 |
| 27.73871892 | 1224.135 |
| 27.75571892 | 1152.045 |
| 27.77271892 | 1124.237 |
| 27.78971892 | 1162.314 |
| 27.80671892 | 1173.751 |
| 27.82371892 | 1122.349 |
| 27.84071892 | 1179.065 |
| 27.85771892 | 1110.793 |
| 27.87471892 | 1098.036 |
| 27.89171892 | 1173.455 |
| 27.90871892 | 1201.948 |
| 27.92571892 | 1267.261 |
| 27.94271892 | 1297.565 |
| 27.95971892 | 1269.237 |
| 27.97671892 | 1265.574 |
| 27.99371892 | 1356.11 |
| 28.01071892 | 1362.903 |
| 28.02771892 | 1359.466 |
| 28.04471892 | 1368.46 |
| 28.06171892 | 1329.993 |
| 28.07871892 | 1329.512 |
| 28.09571892 | 1384.854 |
| 28.11271892 | 1390.007 |
| 28.12971892 | 1370.732 |
| 28.14671892 | 1389.56 |
| 28.16371892 | 1405.361 |
| 28.18071892 | 1457.151 |
| 28.19771892 | 1485.019 |
| 28.21471892 | 1582.671 |
| 28.23171892 | 1746.48 |
| 28.24871892 | 1840.206 |
| 28.26571892 | 1855.494 |
| 28.28271892 | 1783.469 |
| 28.29971892 | 1923.22 |
| 28.31671892 | 1952.389 |
| 28.33371892 | 1962.858 |
| 28.35071892 | 1873.061 |
| 28.36771892 | 1765.487 |
| 28.38471892 | 1599.42 |
| 28.40171892 | 1581.525 |
| 28.41871892 | 1644.976 |
| 28.43571892 | 1500.438 |
| 28.45271892 | 1496.431 |
| 28.46971892 | 1469.189 |
| 28.48671892 | 1513.553 |
| 28.50371892 | 1438.943 |
| 28.52071892 | 1462.158 |
| 28.53771892 | 1416.708 |
| 28.55471892 | 1422.88 |
| 28.57171892 | 1425.641 |
| 28.58871892 | 1452.673 |
| 28.60571892 | 1396.347 |
| 28.62271892 | 1374.912 |
| 28.63971892 | 1394.919 |
| 28.65671892 | 1401.324 |
| 28.67371892 | 1421.41 |
| 28.69071892 | 1417.002 |
| 28.70771892 | 1411.437 |
| 28.72471892 | 1461.813 |
| 28.74171892 | 1523.322 |
| 28.75871892 | 1482.764 |
| 28.77571892 | 1444.028 |
| 28.79271892 | 1471.644 |
| 28.80971892 | 1483.455 |
| 28.82671892 | 1568.404 |
| 28.84371892 | 1567.493 |
| 28.86071892 | 1436.241 |
| 28.87771892 | 1500.368 |
| 28.89471892 | 1598.433 |
| 28.91171892 | 1609.253 |
| 28.92871892 | 1594.032 |
| 28.94571892 | 1638.923 |
| 28.96271892 | 1629.436 |
| 28.97971892 | 1574.031 |
| 28.99671892 | 1709.962 |
| 29.01371892 | 1748.045 |
| 29.03071892 | 1830.101 |
| 29.04771892 | 1769.902 |
| 29.06471892 | 1933.039 |
| 29.08171892 | 1995.402 |
| 29.09871892 | 2252.444 |
| 29.11571892 | 2295.914 |
| 29.13271892 | 2269.437 |
| 29.14971892 | 2294.808 |
| 29.16671892 | 2234.043 |
| 29.18371892 | 2322.158 |
| 29.20071892 | 2349.37 |
| 29.21771892 | 2390.425 |
| 29.23471892 | 2444.817 |
| 29.25171892 | 2547.591 |
| 29.26871892 | 2654.457 |
| 29.28571892 | 2858.882 |
| 29.30271892 | 3040.524 |
| 29.31971892 | 3221.632 |
| 29.33671892 | 3367.284 |
| 29.35371892 | 3534.062 |
| 29.37071892 | 3775.039 |
| 29.38771892 | 4089.32 |
| 29.40471892 | 4470.033 |
| 29.42171892 | 4898.138 |
| 29.43871892 | 5407.052 |
| 29.45571892 | 6114.604 |
| 29.47271892 | 7147.582 |
| 29.48971892 | 8431.05 |
| 29.50671892 | 9864.285 |
| 29.52371892 | 11502.947 |
| 29.54071892 | 13246.833 |
| 29.55771892 | 14910.328 |
| 29.57471892 | 16340.571 |
| 29.59171892 | 17220.649 |
| 29.60871892 | 17272.902 |
| 29.62571892 | 16661.933 |
| 29.64271892 | 15690.243 |
| 29.65971892 | 14691.146 |
| 29.67671892 | 13593.392 |
| 29.69371892 | 12160.939 |
| 29.71071892 | 10515.864 |
| 29.72771892 | 8873.205 |
| 29.74471892 | 7596.714 |
| 29.76171892 | 6473.567 |
| 29.77871892 | 5591.542 |
| 29.79571892 | 4899.025 |
| 29.81271892 | 4474.854 |
| 29.82971892 | 4133.258 |
| 29.84671892 | 3814.293 |
| 29.86371892 | 3585.698 |
| 29.88071892 | 3335.174 |
| 29.89771892 | 3180.448 |
| 29.91471892 | 3013.978 |
| 29.93171892 | 2888.788 |
| 29.94871892 | 2834.752 |
| 29.96571892 | 2742.404 |
| 29.98271892 | 2601.931 |
| 29.99971892 | 2439.521 |
| 30.01671892 | 2334.835 |
| 30.03371892 | 2248.586 |
| 30.05071892 | 2197.745 |
| 30.06771892 | 2121.362 |
| 30.08471892 | 2067.849 |
| 30.10171892 | 2105.618 |
| 30.11871892 | 2101.181 |
| 30.13571892 | 2020.979 |
| 30.15271892 | 1972.308 |
| 30.16971892 | 1987.252 |
| 30.18671892 | 1945.542 |
| 30.20371892 | 1864.773 |
| 30.22071892 | 1927.075 |
| 30.23771892 | 1893.495 |
| 30.25471892 | 1814.159 |
| 30.27171892 | 1808.109 |
| 30.28871892 | 1823.46 |
| 30.30571892 | 1794.797 |
| 30.32271892 | 1804.461 |
| 30.33971892 | 1736.196 |
| 30.35671892 | 1763.61 |
| 30.37371892 | 1659.792 |
| 30.39071892 | 1703.538 |
| 30.40771892 | 1706.068 |
| 30.42471892 | 1576.784 |
| 30.44171892 | 1681.505 |
| 30.45871892 | 1664.915 |
| 30.47571892 | 1669.985 |
| 30.49271892 | 1580.009 |
| 30.50971892 | 1557.365 |
| 30.52671892 | 1585.999 |
| 30.54371892 | 1616.851 |
| 30.56071892 | 1656.616 |
| 30.57771892 | 1512.27 |
| 30.59471892 | 1585.153 |
| 30.61171892 | 1677.149 |
| 30.62871892 | 1549.167 |
| 30.64571892 | 1505.096 |
| 30.66271892 | 1526.427 |
| 30.67971892 | 1541.314 |
| 30.69671892 | 1575.568 |
| 30.71371892 | 1614.004 |
| 30.73071892 | 1622.659 |
| 30.74771892 | 1703.292 |
| 30.76471892 | 1795.134 |
| 30.78171892 | 1859.295 |
| 30.79871892 | 1935.374 |
| 30.81571892 | 2028.441 |
| 30.83271892 | 2100.585 |
| 30.84971892 | 2156.031 |
| 30.86671892 | 2291.105 |
| 30.88371892 | 2419.991 |
| 30.90071892 | 2522.195 |
| 30.91771892 | 2676.212 |
| 30.93471892 | 2956.442 |
| 30.95171892 | 3415.169 |
| 30.96871892 | 4005.228 |
| 30.98571892 | 4733.362 |
| 31.00271892 | 5827.554 |
| 31.01971892 | 7287.611 |
| 31.03671892 | 8910.584 |
| 31.05371892 | 10028.201 |
| 31.07071892 | 10317.518 |
| 31.08771892 | 9751.865 |
| 31.10471892 | 8888.314 |
| 31.12171892 | 8352.254 |
| 31.13871892 | 8169.512 |
| 31.15571892 | 7504.638 |
| 31.17271892 | 6414.102 |
| 31.18971892 | 5225.144 |
| 31.20671892 | 4219.068 |
| 31.22371892 | 3342.18 |
| 31.24071892 | 2893.915 |
| 31.25771892 | 2533.497 |
| 31.27471892 | 2301.867 |
| 31.29171892 | 2279.905 |
| 31.30871892 | 2203.502 |
| 31.32571892 | 1992.913 |
| 31.34271892 | 1844.368 |
| 31.35971892 | 1780.936 |
| 31.37671892 | 1753.082 |
| 31.39371892 | 1649.692 |
| 31.41071892 | 1577.973 |
| 31.42771892 | 1541.866 |
| 31.44471892 | 1551.718 |
| 31.46171892 | 1601.26 |
| 31.47871892 | 1613.881 |
| 31.49571892 | 1601.999 |
| 31.51271892 | 1620.199 |
| 31.52971892 | 1679.542 |
| 31.54671892 | 1739.276 |
| 31.56371892 | 1877.45 |
| 31.58071892 | 2045.532 |
| 31.59771892 | 2185.632 |
| 31.61471892 | 2244.721 |
| 31.63171892 | 2238.555 |
| 31.64871892 | 2272.399 |
| 31.66571892 | 2225.954 |
| 31.68271892 | 2174.419 |
| 31.69971892 | 2088.569 |
| 31.71671892 | 2088.852 |
| 31.73371892 | 1929.317 |
| 31.75071892 | 1871.708 |
| 31.76771892 | 1749.326 |
| 31.78471892 | 1580.301 |
| 31.80171892 | 1488.164 |
| 31.81871892 | 1589.478 |
| 31.83571892 | 1608.319 |
| 31.85271892 | 1537.149 |
| 31.86971892 | 1773.151 |
| 31.88671892 | 2033.281 |
| 31.90371892 | 2412.827 |
| 31.92071892 | 2787.61 |
| 31.93771892 | 3093.489 |
| 31.95471892 | 3170.326 |
| 31.97171892 | 3046.49 |
| 31.98871892 | 2791.734 |
| 32.00571892 | 2601.438 |
| 32.02271892 | 2492.173 |
| 32.03971892 | 2485.256 |
| 32.05671892 | 2298.75 |
| 32.07371892 | 1963.786 |
| 32.09071892 | 1660.199 |
| 32.10771892 | 1438.28 |
| 32.12471892 | 1376.918 |
| 32.14171892 | 1384.426 |
| 32.15871892 | 1284.822 |
| 32.17571892 | 1218.588 |
| 32.19271892 | 1273.654 |
| 32.20971892 | 1293.958 |
| 32.22671892 | 1368.4 |
| 32.24371892 | 1498.638 |
| 32.26071892 | 1656.27 |
| 32.27771892 | 1919.059 |
| 32.29471892 | 2200.911 |
| 32.31171892 | 2387.95 |
| 32.32871892 | 2395.417 |
| 32.34571892 | 2301.634 |
| 32.36271892 | 2111.996 |
| 32.37971892 | 1976.935 |
| 32.39671892 | 1951.386 |
| 32.41371892 | 1891.864 |
| 32.43071892 | 1755.863 |
| 32.44771892 | 1616.794 |
| 32.46471892 | 1555.681 |
| 32.48171892 | 1565.053 |
| 32.49871892 | 1302.267 |
| 32.51571892 | 1316.949 |
| 32.53271892 | 1230.413 |
| 32.54971892 | 1198.852 |
| 32.56671892 | 1241.385 |
| 32.58371892 | 1145.119 |
| 32.60071892 | 1089.793 |
| 32.61771892 | 1092.412 |
| 32.63471892 | 1119.267 |
| 32.65171892 | 1032.472 |
| 32.66871892 | 1005.537 |
| 32.68571892 | 1042.994 |
| 32.70271892 | 988.071 |
| 32.71971892 | 1034.214 |
| 32.73671892 | 1095.514 |
| 32.75371892 | 1122.7 |
| 32.77071892 | 1060.262 |
| 32.78771892 | 1049.199 |
| 32.80471892 | 1076.937 |
| 32.82171892 | 1016.884 |
| 32.83871892 | 1039.344 |
| 32.85571892 | 1092.911 |
| 32.87271892 | 1071.518 |
| 32.88971892 | 1109.719 |
| 32.90671892 | 1135.536 |
| 32.92371892 | 1118.208 |
| 32.94071892 | 1100 |
| 32.95771892 | 1111.258 |
| 32.97471892 | 1155.513 |
| 32.99171892 | 1257.126 |
| 33.00871892 | 1421.884 |
| 33.02571892 | 1450.019 |
| 33.04271892 | 1867.109 |
| 33.05971892 | 2362.636 |
| 33.07671892 | 2999.756 |
| 33.09371892 | 3567.276 |
| 33.11071892 | 3538.808 |
| 33.12771892 | 3116.704 |
| 33.14471892 | 2751.373 |
| 33.16171892 | 2774.309 |
| 33.17871892 | 2800.452 |
| 33.19571892 | 2542.118 |
| 33.21271892 | 2277.943 |
| 33.22971892 | 1843.297 |
| 33.24671892 | 1553.129 |
| 33.26371892 | 1269.658 |
| 33.28071892 | 1260.925 |
| 33.29771892 | 1207.215 |
| 33.31471892 | 1115.862 |
| 33.33171892 | 1084.212 |
| 33.34871892 | 1075.183 |
| 33.36571892 | 1046.938 |
| 33.38271892 | 1053.059 |
| 33.39971892 | 1054.176 |
| 33.41671892 | 1040.211 |
| 33.43371892 | 1077.854 |
| 33.45071892 | 1068.76 |
| 33.46771892 | 1071.682 |
| 33.48471892 | 1067.84 |
| 33.50171892 | 1043.258 |
| 33.51871892 | 1081.334 |
| 33.53571892 | 1137.294 |
| 33.55271892 | 1193.213 |
| 33.56971892 | 1342.781 |
| 33.58671892 | 1584.533 |
| 33.60371892 | 1726.909 |
| 33.62071892 | 1841.424 |
| 33.63771892 | 1959.299 |
| 33.65471892 | 2013.528 |
| 33.67171892 | 1892.089 |
| 33.68871892 | 1855.303 |
| 33.70571892 | 1689.954 |
| 33.72271892 | 1656.181 |
| 33.73971892 | 1638.848 |
| 33.75671892 | 1450.408 |
| 33.77371892 | 1285.361 |
| 33.79071892 | 1187.943 |
| 33.80771892 | 1109.721 |
| 33.82471892 | 1140.054 |
| 33.84171892 | 1131.628 |
| 33.85871892 | 1131.371 |
| 33.87571892 | 1085.688 |
| 33.89271892 | 1052.286 |
| 33.90971892 | 1105.383 |
| 33.92671892 | 1059.077 |
| 33.94371892 | 1056.601 |
| 33.96071892 | 1039.346 |
| 33.97771892 | 1088.812 |
| 33.99471892 | 1073.756 |
| 34.01171892 | 1045.948 |
| 34.02871892 | 1068.891 |
| 34.04571892 | 1043.86 |
| 34.06271892 | 1073.837 |
| 34.07971892 | 1080.111 |
| 34.09671892 | 1105.986 |
| 34.11371892 | 1175.779 |
| 34.13071892 | 1328.418 |
| 34.14771892 | 1487.288 |
| 34.16471892 | 1695.288 |
| 34.18171892 | 1828.079 |
| 34.19871892 | 1803.42 |
| 34.21571892 | 1748.891 |
| 34.23271892 | 1655.443 |
| 34.24971892 | 1559.695 |
| 34.26671892 | 1521.095 |
| 34.28371892 | 1549.336 |
| 34.30071892 | 1560.845 |
| 34.31771892 | 1423.077 |
| 34.33471892 | 1235.833 |
| 34.35171892 | 1218.481 |
| 34.36871892 | 1118.895 |
| 34.38571892 | 1115.764 |
| 34.40271892 | 1086.262 |
| 34.41971892 | 1114.079 |
| 34.43671892 | 1107.685 |
| 34.45371892 | 1004.681 |
| 34.47071892 | 1064.956 |
| 34.48771892 | 1000.924 |
| 34.50471892 | 1053.132 |
| 34.52171892 | 1030.374 |
| 34.53871892 | 963.427 |
| 34.55571892 | 1023.862 |
| 34.57271892 | 1055.214 |
| 34.58971892 | 932.102 |
| 34.60671892 | 1095.473 |
| 34.62371892 | 1048.166 |
| 34.64071892 | 990.413 |
| 34.65771892 | 1040.44 |
| 34.67471892 | 982.075 |
| 34.69171892 | 972.51 |
| 34.70871892 | 958.424 |
| 34.72571892 | 986.5 |
| 34.74271892 | 988.934 |
| 34.75971892 | 989.167 |
| 34.77671892 | 955.67 |
| 34.79371892 | 969.061 |
| 34.81071892 | 950.183 |
| 34.82771892 | 963.365 |
| 34.84471892 | 947.538 |
| 34.86171892 | 915.942 |
| 34.87871892 | 964.365 |
| 34.89571892 | 989.8 |
| 34.91271892 | 984.018 |
| 34.92971892 | 943.905 |
| 34.94671892 | 977.895 |
| 34.96371892 | 967.006 |
| 34.98071892 | 974.469 |
| 34.99771892 | 933.318 |
| 35.01471892 | 961.889 |
| 35.03171892 | 962.843 |
| 35.04871892 | 997.821 |
| 35.06571892 | 1009.95 |
| 35.08271892 | 1019.47 |
| 35.09971892 | 1075.984 |
| 35.11671892 | 1064.002 |
| 35.13371892 | 1032.008 |
| 35.15071892 | 1131.308 |
| 35.16771892 | 1011.244 |
| 35.18471892 | 1107.855 |
| 35.20171892 | 1113.383 |
| 35.21871892 | 1121.937 |
| 35.23571892 | 1110.243 |
| 35.25271892 | 1132.791 |
| 35.26971892 | 1120.503 |
| 35.28671892 | 1176.38 |
| 35.30371892 | 1217.802 |
| 35.32071892 | 1259.568 |
| 35.33771892 | 1286.733 |
| 35.35471892 | 1348.054 |
| 35.37171892 | 1545.683 |
| 35.38871892 | 1637.78 |
| 35.40571892 | 1696.65 |
| 35.42271892 | 1696.273 |
| 35.43971892 | 1767.241 |
| 35.45671892 | 1803.175 |
| 35.47371892 | 1859.198 |
| 35.49071892 | 1890.779 |
| 35.50771892 | 1950.887 |
| 35.52471892 | 1998.241 |
| 35.54171892 | 2025.247 |
| 35.55871892 | 2060.488 |
| 35.57571892 | 1983.373 |
| 35.59271892 | 1926.338 |
| 35.60971892 | 1927.912 |
| 35.62671892 | 1907.878 |
| 35.64371892 | 1885.038 |
| 35.66071892 | 1815.89 |
| 35.67771892 | 1754.365 |
| 35.69471892 | 1673.125 |
| 35.71171892 | 1575.607 |
| 35.72871892 | 1580.742 |
| 35.74571892 | 1526.381 |
| 35.76271892 | 1473.546 |
| 35.77971892 | 1477.584 |
| 35.79671892 | 1480.421 |
| 35.81371892 | 1417.272 |
| 35.83071892 | 1518.994 |
| 35.84771892 | 1493.237 |
| 35.86471892 | 1483.412 |
| 35.88171892 | 1382.981 |
| 35.89871892 | 1498.374 |
| 35.91571892 | 1518.653 |
| 35.93271892 | 1433.199 |
| 35.94971892 | 1562.097 |
| 35.96671892 | 1651.183 |
| 35.98371892 | 1765.533 |
| 36.00071892 | 1821.35 |
| 36.01771892 | 1885.309 |
| 36.03471892 | 2045.375 |
| 36.05171892 | 2219.72 |
| 36.06871892 | 2525.276 |
| 36.08571892 | 2789.954 |
| 36.10271892 | 3072.25 |
| 36.11971892 | 3387.906 |
| 36.13671892 | 3653.952 |
| 36.15371892 | 3856.847 |
| 36.17071892 | 3911.213 |
| 36.18771892 | 3839.36 |
| 36.20471892 | 3728.807 |
| 36.22171892 | 3605.92 |
| 36.23871892 | 3433.143 |
| 36.25571892 | 3230.043 |
| 36.27271892 | 3054.805 |
| 36.28971892 | 2808.118 |
| 36.30671892 | 2543.259 |
| 36.32371892 | 2293.659 |
| 36.34071892 | 2183.67 |
| 36.35771892 | 2088.736 |
| 36.37471892 | 1865.876 |
| 36.39171892 | 1713.979 |
| 36.40871892 | 1681.421 |
| 36.42571892 | 1586.456 |
| 36.44271892 | 1537.577 |
| 36.45971892 | 1466.074 |
| 36.47671892 | 1340.757 |
| 36.49371892 | 1329.196 |
| 36.51071892 | 1308.111 |
| 36.52771892 | 1322.847 |
| 36.54471892 | 1315.457 |
| 36.56171892 | 1297.044 |
| 36.57871892 | 1256.135 |
| 36.59571892 | 1208.968 |
| 36.61271892 | 1200.507 |
| 36.62971892 | 1295.71 |
| 36.64671892 | 1269.789 |
| 36.66371892 | 1212.258 |
| 36.68071892 | 1206.464 |
| 36.69771892 | 1192.631 |
| 36.71471892 | 1118.008 |
| 36.73171892 | 1138.141 |
| 36.74871892 | 1139.895 |
| 36.76571892 | 1134.25 |
| 36.78271892 | 1184.432 |
| 36.79971892 | 1078.417 |
| 36.81671892 | 1101.739 |
| 36.83371892 | 1133.193 |
| 36.85071892 | 1119.464 |
| 36.86771892 | 1072.148 |
| 36.88471892 | 997.379 |
| 36.90171892 | 1022.318 |
| 36.91871892 | 1044.737 |
| 36.93571892 | 1075.274 |
| 36.95271892 | 1123.601 |
| 36.96971892 | 1073.195 |
| 36.98671892 | 991.48 |
| 37.00371892 | 1025.717 |
| 37.02071892 | 1067.229 |
| 37.03771892 | 1060.673 |
| 37.05471892 | 1069.092 |
| 37.07171892 | 1018.815 |
| 37.08871892 | 1013.301 |
| 37.10571892 | 1108.38 |
| 37.12271892 | 1182.685 |
| 37.13971892 | 1188.313 |
| 37.15671892 | 1011.228 |
| 37.17371892 | 1236.997 |
| 37.19071892 | 1075.117 |
| 37.20771892 | 1178.919 |
| 37.22471892 | 1110.908 |
| 37.24171892 | 1155.166 |
| 37.25871892 | 1104.479 |
| 37.27571892 | 1045.532 |
| 37.29271892 | 1173.501 |
| 37.30971892 | 1129.476 |
| 37.32671892 | 1139.92 |
| 37.34371892 | 1257.574 |
| 37.36071892 | 1257.137 |
| 37.37771892 | 1254.976 |
| 37.39471892 | 1359.256 |
| 37.41171892 | 1345.506 |
| 37.42871892 | 1465.281 |
| 37.44571892 | 1653.841 |
| 37.46271892 | 1762.296 |
| 37.47971892 | 1739.737 |
| 37.49671892 | 1642.609 |
| 37.51371892 | 1583.4 |
| 37.53071892 | 1544.663 |
| 37.54771892 | 1518.213 |
| 37.56471892 | 1533.782 |
| 37.58171892 | 1487.369 |
| 37.59871892 | 1334.811 |
| 37.61571892 | 1241.669 |
| 37.63271892 | 1246.128 |
| 37.64971892 | 1193.38 |
| 37.66671892 | 1128.842 |
| 37.68371892 | 1093.752 |
| 37.70071892 | 1066.437 |
| 37.71771892 | 1058.374 |
| 37.73471892 | 1042.972 |
| 37.75171892 | 1040.173 |
| 37.76871892 | 1036.643 |
| 37.78571892 | 1015.898 |
| 37.80271892 | 1085.266 |
| 37.81971892 | 946.453 |
| 37.83671892 | 1065.069 |
| 37.85371892 | 1027.364 |
| 37.87071892 | 982.463 |
| 37.88771892 | 1103.95 |
| 37.90471892 | 998.459 |
| 37.92171892 | 1032.271 |
| 37.93871892 | 1077.947 |
| 37.95571892 | 991.028 |
| 37.97271892 | 1060.755 |
| 37.98971892 | 986.247 |
| 38.00671892 | 1022.988 |
| 38.02371892 | 991.284 |
| 38.04071892 | 995.37 |
| 38.05771892 | 1061.352 |
| 38.07471892 | 1009.479 |
| 38.09171892 | 1014.579 |
| 38.10871892 | 1006.577 |
| 38.12571892 | 985.239 |
| 38.14271892 | 1023.022 |
| 38.15971892 | 1054.45 |
| 38.17671892 | 1033.859 |
| 38.19371892 | 973.931 |
| 38.21071892 | 978.618 |
| 38.22771892 | 1029.354 |
| 38.24471892 | 1057.385 |
| 38.26171892 | 1057.836 |
| 38.27871892 | 1016.894 |
| 38.29571892 | 970.841 |
| 38.31271892 | 986.641 |
| 38.32971892 | 1040.62 |
| 38.34671892 | 1016.93 |
| 38.36371892 | 1002.915 |
| 38.38071892 | 1026.982 |
| 38.39771892 | 1063.325 |
| 38.41471892 | 1019.642 |
| 38.43171892 | 970.305 |
| 38.44871892 | 984.9 |
| 38.46571892 | 927.42 |
| 38.48271892 | 906.686 |
| 38.49971892 | 1004.102 |
| 38.51671892 | 1090.266 |
| 38.53371892 | 1075.221 |
| 38.55071892 | 912.6 |
| 38.56771892 | 1004.151 |
| 38.58471892 | 1038.07 |
| 38.60171892 | 1043.745 |
| 38.61871892 | 1017.389 |
| 38.63571892 | 1023.623 |
| 38.65271892 | 1016.217 |
| 38.66971892 | 1121.072 |
| 38.68671892 | 1050.916 |
| 38.70371892 | 1017.991 |
| 38.72071892 | 995.874 |
| 38.73771892 | 1023.016 |
| 38.75471892 | 1009.944 |
| 38.77171892 | 1123.368 |
| 38.78871892 | 1146.113 |
| 38.80571892 | 1142.613 |
| 38.82271892 | 1113.632 |
| 38.83971892 | 1069.059 |
| 38.85671892 | 1015.414 |
| 38.87371892 | 1073.852 |
| 38.89071892 | 1192.892 |
| 38.90771892 | 1167.868 |
| 38.92471892 | 1086.615 |
| 38.94171892 | 1117.537 |
| 38.95871892 | 1156.549 |
| 38.97571892 | 1177.272 |
| 38.99271892 | 1204.191 |
| 39.00971892 | 1174.734 |
| 39.02671892 | 1212.72 |
| 39.04371892 | 1261.881 |
| 39.06071892 | 1195.356 |
| 39.07771892 | 1236.524 |
| 39.09471892 | 1257.58 |
| 39.11171892 | 1244.99 |
| 39.12871892 | 1251.482 |
| 39.14571892 | 1292.495 |
| 39.16271892 | 1324.018 |
| 39.17971892 | 1196.681 |
| 39.19671892 | 1403.836 |
| 39.21371892 | 1352.91 |
| 39.23071892 | 1355.708 |
| 39.24771892 | 1289.366 |
| 39.26471892 | 1443.235 |
| 39.28171892 | 1521.611 |
| 39.29871892 | 1610.647 |
| 39.31571892 | 1732.318 |
| 39.33271892 | 1711.576 |
| 39.34971892 | 1840.196 |
| 39.36671892 | 2005.758 |
| 39.38371892 | 2006.073 |
| 39.40071892 | 2042.664 |
| 39.41771892 | 2049.534 |
| 39.43471892 | 2171.515 |
| 39.45171892 | 2328.776 |
| 39.46871892 | 2496.138 |
| 39.48571892 | 2693.26 |
| 39.50271892 | 2970.232 |
| 39.51971892 | 3352.267 |
| 39.53671892 | 3651.892 |
| 39.55371892 | 3978.614 |
| 39.57071892 | 4326.58 |
| 39.58771892 | 4673.847 |
| 39.60471892 | 4921.149 |
| 39.62171892 | 4942.026 |
| 39.63871892 | 4869.363 |
| 39.65571892 | 4703.879 |
| 39.67271892 | 4452.12 |
| 39.68971892 | 4315.079 |
| 39.70671892 | 4193.43 |
| 39.72371892 | 3981.282 |
| 39.74071892 | 3750.408 |
| 39.75771892 | 3406.899 |
| 39.77471892 | 3222.843 |
| 39.79171892 | 2884.75 |
| 39.80871892 | 2588.664 |
| 39.82571892 | 2444.205 |
| 39.84271892 | 2218.599 |
| 39.85971892 | 2031.17 |
| 39.87671892 | 2060.761 |
| 39.89371892 | 1837.157 |
| 39.91071892 | 1878.078 |
| 39.92771892 | 1771.22 |
| 39.94471892 | 1861.422 |
| 39.96171892 | 1875.438 |
| 39.97871892 | 2114.699 |
| 39.99571892 | 2226.626 |
| 40.01271892 | 2203.599 |
| 40.02971892 | 2114.839 |
| 40.04671892 | 1927.367 |
| 40.06371892 | 1814.454 |
| 40.08071892 | 1807.03 |
| 40.09771892 | 1784.654 |
| 40.11471892 | 1823.852 |
| 40.13171892 | 1723.716 |
| 40.14871892 | 1658.413 |
| 40.16571892 | 1526.507 |
| 40.18271892 | 1403.188 |
| 40.19971892 | 1401.937 |
| 40.21671892 | 1307.343 |
| 40.23371892 | 1266.134 |
| 40.25071892 | 1284.219 |
| 40.26771892 | 1252.996 |
| 40.28471892 | 1187.8 |
| 40.30171892 | 1133.328 |
| 40.31871892 | 1156.566 |
| 40.33571892 | 1145.757 |
| 40.35271892 | 1154.248 |
| 40.36971892 | 1167.275 |
| 40.38671892 | 1229.341 |
| 40.40371892 | 1249 |
| 40.42071892 | 1234.694 |
| 40.43771892 | 1182.003 |
| 40.45471892 | 1148.913 |
| 40.47171892 | 1155.109 |
| 40.48871892 | 1172.802 |
| 40.50571892 | 1121.014 |
| 40.52271892 | 1180.56 |
| 40.53971892 | 1257.487 |
| 40.55671892 | 1164.147 |
| 40.57371892 | 1129.038 |
| 40.59071892 | 1200 |
| 40.60771892 | 1200 |
| 40.62471892 | 1246.715 |
| 40.64171892 | 1289.19 |
| 40.65871892 | 1144.157 |
| 40.67571892 | 1138.558 |
| 40.69271892 | 1050.728 |
| 40.70971892 | 1096.499 |
| 40.72671892 | 1151.616 |
| 40.74371892 | 1175.189 |
| 40.76071892 | 1133.479 |
| 40.77771892 | 1121.278 |
| 40.79471892 | 1131.831 |
| 40.81171892 | 1090.21 |
| 40.82871892 | 1127.047 |
| 40.84571892 | 1121.879 |
| 40.86271892 | 1134.956 |
| 40.87971892 | 1174.866 |
| 40.89671892 | 1241.844 |
| 40.91371892 | 1282.476 |
| 40.93071892 | 1234.86 |
| 40.94771892 | 1203.342 |
| 40.96471892 | 1215.109 |
| 40.98171892 | 1213.572 |
| 40.99871892 | 1238.551 |
| 41.01571892 | 1301.439 |
| 41.03271892 | 1349.819 |
| 41.04971892 | 1364.16 |
| 41.06671892 | 1429.688 |
| 41.08371892 | 1447.719 |
| 41.10071892 | 1510.785 |
| 41.11771892 | 1536.352 |
| 41.13471892 | 1596.186 |
| 41.15171892 | 1709.113 |
| 41.16871892 | 1970.106 |
| 41.18571892 | 2141.001 |
| 41.20271892 | 2369.199 |
| 41.21971892 | 2656.668 |
| 41.23671892 | 2765.037 |
| 41.25371892 | 2709.515 |
| 41.27071892 | 2563.457 |
| 41.28771892 | 2418.638 |
| 41.30471892 | 2342.792 |
| 41.32171892 | 2260.536 |
| 41.33871892 | 2275.691 |
| 41.35571892 | 2125.546 |
| 41.37271892 | 1949.664 |
| 41.38971892 | 1873.241 |
| 41.40671892 | 1699.367 |
| 41.42371892 | 1578.874 |
| 41.44071892 | 1538.731 |
| 41.45771892 | 1460.602 |
| 41.47471892 | 1397.289 |
| 41.49171892 | 1355.023 |
| 41.50871892 | 1302.501 |
| 41.52571892 | 1233.643 |
| 41.54271892 | 1280.981 |
| 41.55971892 | 1257.541 |
| 41.57671892 | 1193.151 |
| 41.59371892 | 1171.969 |
| 41.61071892 | 1135.951 |
| 41.62771892 | 1090.039 |
| 41.64471892 | 1050.354 |
| 41.66171892 | 1087.946 |
| 41.67871892 | 1159.292 |
| 41.69571892 | 1180.879 |
| 41.71271892 | 1198.102 |
| 41.72971892 | 1159.469 |
| 41.74671892 | 1122.707 |
| 41.76371892 | 1075.908 |
| 41.78071892 | 1039.136 |
| 41.79771892 | 1087.469 |
| 41.81471892 | 1180.354 |
| 41.83171892 | 1115.408 |
| 41.84871892 | 1194.459 |
| 41.86571892 | 1112.819 |
| 41.88271892 | 1140.175 |
| 41.89971892 | 1136.827 |
| 41.91671892 | 1090.466 |
| 41.93371892 | 1081.401 |
| 41.95071892 | 1067.792 |
| 41.96771892 | 1137.989 |
| 41.98471892 | 1156.612 |
| 42.00171892 | 1234.395 |
| 42.01871892 | 1151.325 |
| 42.03571892 | 1117.092 |
| 42.05271892 | 1143.445 |
| 42.06971892 | 1148.913 |
| 42.08671892 | 1169.439 |
| 42.10371892 | 1210.157 |
| 42.12071892 | 1161.4 |
| 42.13771892 | 1230.99 |
| 42.15471892 | 1302.68 |
| 42.17171892 | 1356.516 |
| 42.18871892 | 1404.82 |
| 42.20571892 | 1444.96 |
| 42.22271892 | 1365.098 |
| 42.23971892 | 1293.959 |
| 42.25671892 | 1232.166 |
| 42.27371892 | 1189.893 |
| 42.29071892 | 1256.067 |
| 42.30771892 | 1282.704 |
| 42.32471892 | 1213.129 |
| 42.34171892 | 1180.389 |
| 42.35871892 | 1227.409 |
| 42.37571892 | 1202.158 |
| 42.39271892 | 1086.494 |
| 42.40971892 | 1142.511 |
| 42.42671892 | 1211.084 |
| 42.44371892 | 1186.314 |
| 42.46071892 | 1198.377 |
| 42.47771892 | 1218.736 |
| 42.49471892 | 1155.735 |
| 42.51171892 | 1298.757 |
| 42.52871892 | 1265.608 |
| 42.54571892 | 1209.756 |
| 42.56271892 | 1124.101 |
| 42.57971892 | 1143.304 |
| 42.59671892 | 1188.44 |
| 42.61371892 | 1211.159 |
| 42.63071892 | 1123.467 |
| 42.64771892 | 1156.357 |
| 42.66471892 | 1165.671 |
| 42.68171892 | 1134.397 |
| 42.69871892 | 1192.59 |
| 42.71571892 | 1167.147 |
| 42.73271892 | 1161.895 |
| 42.74971892 | 1192.999 |
| 42.76671892 | 1219.559 |
| 42.78371892 | 1160.72 |
| 42.80071892 | 1143.41 |
| 42.81771892 | 1234.515 |
| 42.83471892 | 1279.661 |
| 42.85171892 | 1245.198 |
| 42.86871892 | 1273.279 |
| 42.88571892 | 1297.64 |
| 42.90271892 | 1347.298 |
| 42.91971892 | 1390.148 |
| 42.93671892 | 1365.274 |
| 42.95371892 | 1390.509 |
| 42.97071892 | 1435.357 |
| 42.98771892 | 1374.111 |
| 43.00471892 | 1385.141 |
| 43.02171892 | 1465.068 |
| 43.03871892 | 1466.722 |
| 43.05571892 | 1513.558 |
| 43.07271892 | 1551.667 |
| 43.08971892 | 1634.53 |
| 43.10671892 | 1728.472 |
| 43.12371892 | 1827.065 |
| 43.14071892 | 1843.168 |
| 43.15771892 | 1971.703 |
| 43.17471892 | 1944.966 |
| 43.19171892 | 2171.796 |
| 43.20871892 | 2255.909 |
| 43.22571892 | 2458.021 |
| 43.24271892 | 2696.714 |
| 43.25971892 | 3029.499 |
| 43.27671892 | 3215.202 |
| 43.29371892 | 3645.302 |
| 43.31071892 | 3992.484 |
| 43.32771892 | 4295.068 |
| 43.34471892 | 4595.801 |
| 43.36171892 | 4842.258 |
| 43.37871892 | 4766.768 |
| 43.39571892 | 4705.778 |
| 43.41271892 | 4524.106 |
| 43.42971892 | 4281.193 |
| 43.44671892 | 4173.909 |
| 43.46371892 | 4080.71 |
| 43.48071892 | 3916.809 |
| 43.49771892 | 3712.71 |
| 43.51471892 | 3454.741 |
| 43.53171892 | 3189.571 |
| 43.54871892 | 2973.581 |
| 43.56571892 | 2689.858 |
| 43.58271892 | 2411.386 |
| 43.59971892 | 2273.08 |
| 43.61671892 | 2128.072 |
| 43.63371892 | 1979.195 |
| 43.65071892 | 1916.43 |
| 43.66771892 | 1901.967 |
| 43.68471892 | 1864.632 |
| 43.70171892 | 1806.165 |
| 43.71871892 | 1780.177 |
| 43.73571892 | 1690.476 |
| 43.75271892 | 1629.898 |
| 43.76971892 | 1629.798 |
| 43.78671892 | 1566.305 |
| 43.80371892 | 1582.397 |
| 43.82071892 | 1677.283 |
| 43.83771892 | 1608.168 |
| 43.85471892 | 1765.062 |
| 43.87171892 | 1810.874 |
| 43.88871892 | 1753.042 |
| 43.90571892 | 1777.04 |
| 43.92271892 | 1775.215 |
| 43.93971892 | 1812.784 |
| 43.95671892 | 1839.504 |
| 43.97371892 | 1785.72 |
| 43.99071892 | 1730.265 |
| 44.00771892 | 1626.626 |
| 44.02471892 | 1636.012 |
| 44.04171892 | 1534.272 |
| 44.05871892 | 1499.854 |
| 44.07571892 | 1459.042 |
| 44.09271892 | 1426.631 |
| 44.10971892 | 1452.09 |
| 44.12671892 | 1339.621 |
| 44.14371892 | 1343.76 |
| 44.16071892 | 1361.836 |
| 44.17771892 | 1289.45 |
| 44.19471892 | 1190.334 |
| 44.21171892 | 1212.806 |
| 44.22871892 | 1197.082 |
| 44.24571892 | 1240.644 |
| 44.26271892 | 1273.201 |
| 44.27971892 | 1227.115 |
| 44.29671892 | 1171.245 |
| 44.31371892 | 1212.911 |
| 44.33071892 | 1280.293 |
| 44.34771892 | 1276.028 |
| 44.36471892 | 1235.202 |
| 44.38171892 | 1213.372 |
| 44.39871892 | 1231.348 |
| 44.41571892 | 1240.264 |
| 44.43271892 | 1268.734 |
| 44.44971892 | 1266.71 |
| 44.46671892 | 1252.783 |
| 44.48371892 | 1357.762 |
| 44.50071892 | 1461.484 |
| 44.51771892 | 1481.233 |
| 44.53471892 | 1493.751 |
| 44.55171892 | 1524.437 |
| 44.56871892 | 1498.916 |
| 44.58571892 | 1405.534 |
| 44.60271892 | 1476.477 |
| 44.61971892 | 1395.815 |
| 44.63671892 | 1448.491 |
| 44.65371892 | 1424.728 |
| 44.67071892 | 1393.596 |
| 44.68771892 | 1416.545 |
| 44.70471892 | 1361.074 |
| 44.72171892 | 1452.711 |
| 44.73871892 | 1420.332 |
| 44.75571892 | 1538.159 |
| 44.77271892 | 1727.238 |
| 44.78971892 | 1676.817 |
| 44.80671892 | 1600.498 |
| 44.82371892 | 1696.402 |
| 44.84071892 | 1721.548 |
| 44.85771892 | 1729.746 |
| 44.87471892 | 1878.813 |
| 44.89171892 | 1915.588 |
| 44.90871892 | 1900 |
| 44.92571892 | 1929.763 |
| 44.94271892 | 1940.493 |
| 44.95971892 | 1931.063 |
| 44.97671892 | 2013.887 |
| 44.99371892 | 2149.356 |
| 45.01071892 | 2287.146 |
| 45.02771892 | 2322.793 |
| 45.04471892 | 2273.028 |
| 45.06171892 | 2227.698 |
| 45.07871892 | 2076.825 |
| 45.09571892 | 1955.315 |
| 45.11271892 | 1916.644 |
| 45.12971892 | 1902.155 |
| 45.14671892 | 1857.119 |
| 45.16371892 | 1813.098 |
| 45.18071892 | 1808.182 |
| 45.19771892 | 1679.557 |
| 45.21471892 | 1546.15 |
| 45.23171892 | 1500.493 |
| 45.24871892 | 1497.598 |
| 45.26571892 | 1449.968 |
| 45.28271892 | 1393.621 |
| 45.29971892 | 1402.212 |
| 45.31671892 | 1373.713 |
| 45.33371892 | 1326.782 |
| 45.35071892 | 1319.301 |
| 45.36771892 | 1354.514 |
| 45.38471892 | 1406.519 |
| 45.40171892 | 1429.62 |
| 45.41871892 | 1458.924 |
| 45.43571892 | 1536.271 |
| 45.45271892 | 1410.4 |
| 45.46971892 | 1319.361 |
| 45.48671892 | 1367.367 |
| 45.50371892 | 1325.078 |
| 45.52071892 | 1379.097 |
| 45.53771892 | 1412.062 |
| 45.55471892 | 1387.877 |
| 45.57171892 | 1353.47 |
| 45.58871892 | 1318.307 |
| 45.60571892 | 1299.265 |
| 45.62271892 | 1320.132 |
| 45.63971892 | 1333.827 |
| 45.65671892 | 1304.749 |
| 45.67371892 | 1243.353 |
| 45.69071892 | 1200.25 |
| 45.70771892 | 1223.412 |
| 45.72471892 | 1205.844 |
| 45.74171892 | 1133.114 |
| 45.75871892 | 1153.54 |
| 45.77571892 | 1204.853 |
| 45.79271892 | 1241.136 |
| 45.80971892 | 1234.076 |
| 45.82671892 | 1226.004 |
| 45.84371892 | 1191.738 |
| 45.86071892 | 1174.331 |
| 45.87771892 | 1166.756 |
| 45.89471892 | 1205.56 |
| 45.91171892 | 1215.984 |
| 45.92871892 | 1234.055 |
| 45.94571892 | 1215.897 |
| 45.96271892 | 1252.002 |
| 45.97971892 | 1289.945 |
| 45.99671892 | 1236.932 |
| 46.01371892 | 1236.932 |
| 46.03071892 | 1248.613 |
| 46.04771892 | 1347.047 |
| 46.06471892 | 1311.444 |
| 46.08171892 | 1212.032 |
| 46.09871892 | 1196.38 |
| 46.11571892 | 1244.155 |
| 46.13271892 | 1265.973 |
| 46.14971892 | 1308.805 |
| 46.16671892 | 1283.731 |
| 46.18371892 | 1332.588 |
| 46.20071892 | 1276.444 |
| 46.21771892 | 1211.199 |
| 46.23471892 | 1220.651 |
| 46.25171892 | 1211.894 |
| 46.26871892 | 1200 |
| 46.28571892 | 1248.295 |
| 46.30271892 | 1269.526 |
| 46.31971892 | 1271.633 |
| 46.33671892 | 1266.447 |
| 46.35371892 | 1256.907 |
| 46.37071892 | 1304.515 |
| 46.38771892 | 1329.783 |
| 46.40471892 | 1274.178 |
| 46.42171892 | 1260.377 |
| 46.43871892 | 1298.963 |
| 46.45571892 | 1288.094 |
| 46.47271892 | 1260.734 |
| 46.48971892 | 1273.419 |
| 46.50671892 | 1305.988 |
| 46.52371892 | 1349.686 |
| 46.54071892 | 1312.043 |
| 46.55771892 | 1356.387 |
| 46.57471892 | 1418.324 |
| 46.59171892 | 1418.816 |
| 46.60871892 | 1396.638 |
| 46.62571892 | 1343.961 |
| 46.64271892 | 1374.007 |
| 46.65971892 | 1466.288 |
| 46.67671892 | 1465.073 |
| 46.69371892 | 1375.851 |
| 46.71071892 | 1378.272 |
| 46.72771892 | 1412.033 |
| 46.74471892 | 1442.981 |
| 46.76171892 | 1460.961 |
| 46.77871892 | 1592.796 |
| 46.79571892 | 1720.556 |
| 46.81271892 | 1833.919 |
| 46.82971892 | 2034.962 |
| 46.84671892 | 2236.313 |
| 46.86371892 | 2455.326 |
| 46.88071892 | 2570.011 |
| 46.89771892 | 2418.089 |
| 46.91471892 | 2228.59 |
| 46.93171892 | 2041.018 |
| 46.94871892 | 1946.485 |
| 46.96571892 | 1963.576 |
| 46.98271892 | 2042.436 |
| 46.99971892 | 2073.878 |
| 47.01671892 | 2066.509 |
| 47.03371892 | 1970.131 |
| 47.05071892 | 1837.442 |
| 47.06771892 | 1818.639 |
| 47.08471892 | 1819.188 |
| 47.10171892 | 1822.761 |
| 47.11871892 | 1858.751 |
| 47.13571892 | 1920.29 |
| 47.15271892 | 1982.251 |
| 47.16971892 | 2018.821 |
| 47.18671892 | 2123.015 |
| 47.20371892 | 2227.637 |
| 47.22071892 | 2326.038 |
| 47.23771892 | 2392.492 |
| 47.25471892 | 2538.581 |
| 47.27171892 | 2728.054 |
| 47.28871892 | 2841.529 |
| 47.30571892 | 2992.16 |
| 47.32271892 | 3053.863 |
| 47.33971892 | 3096.215 |
| 47.35671892 | 3125.326 |
| 47.37371892 | 3086.088 |
| 47.39071892 | 3033.725 |
| 47.40771892 | 3052.992 |
| 47.42471892 | 3051.528 |
| 47.44171892 | 3049.781 |
| 47.45871892 | 3041.131 |
| 47.47571892 | 3106.196 |
| 47.49271892 | 3125.768 |
| 47.50971892 | 3110.975 |
| 47.52671892 | 3165.682 |
| 47.54371892 | 3178.576 |
| 47.56071892 | 3333.102 |
| 47.57771892 | 3470.186 |
| 47.59471892 | 3642.351 |
| 47.61171892 | 3931.497 |
| 47.62871892 | 4228.011 |
| 47.64571892 | 4490.79 |
| 47.66271892 | 4759.839 |
| 47.67971892 | 5088.02 |
| 47.69671892 | 5394.46 |
| 47.71371892 | 5682.682 |
| 47.73071892 | 5887.234 |
| 47.74771892 | 5888.412 |
| 47.76471892 | 5826.387 |
| 47.78171892 | 5704.604 |
| 47.79871892 | 5467.59 |
| 47.81571892 | 5304.511 |
| 47.83271892 | 5106.332 |
| 47.84971892 | 4991.305 |
| 47.86671892 | 4946.252 |
| 47.88371892 | 4738.556 |
| 47.90071892 | 4363.023 |
| 47.91771892 | 4026.667 |
| 47.93471892 | 3763.987 |
| 47.95171892 | 3470.407 |
| 47.96871892 | 3183.893 |
| 47.98571892 | 2984.763 |
| 48.00271892 | 2772.656 |
| 48.01971892 | 2569.191 |
| 48.03671892 | 2444.711 |
| 48.05371892 | 2305.143 |
| 48.07071892 | 2333.07 |
| 48.08771892 | 2177.949 |
| 48.10471892 | 2171.897 |
| 48.12171892 | 2133.754 |
| 48.13871892 | 2096.022 |
| 48.15571892 | 2040.268 |
| 48.17271892 | 2043.597 |
| 48.18971892 | 2016.274 |
| 48.20671892 | 2101.068 |
| 48.22371892 | 2184.768 |
| 48.24071892 | 2305.946 |
| 48.25771892 | 2358.874 |
| 48.27471892 | 2361.553 |
| 48.29171892 | 2331.962 |
| 48.30871892 | 2246.401 |
| 48.32571892 | 2198.686 |
| 48.34271892 | 2197.726 |
| 48.35971892 | 2201.326 |
| 48.37671892 | 2290.668 |
| 48.39371892 | 2339.308 |
| 48.41071892 | 2314.916 |
| 48.42771892 | 2300.697 |
| 48.44471892 | 2280.027 |
| 48.46171892 | 2355.591 |
| 48.47871892 | 2429.6 |
| 48.49571892 | 2443.719 |
| 48.51271892 | 2507.578 |
| 48.52971892 | 2636.497 |
| 48.54671892 | 2826.011 |
| 48.56371892 | 2990.635 |
| 48.58071892 | 3229.17 |
| 48.59771892 | 3406.285 |
| 48.61471892 | 3690.819 |
| 48.63171892 | 4014.821 |
| 48.64871892 | 4383.928 |
| 48.66571892 | 4672.286 |
| 48.68271892 | 4962.707 |
| 48.69971892 | 5187.435 |
| 48.71671892 | 5435.126 |
| 48.73371892 | 5519.668 |
| 48.75071892 | 5439.404 |
| 48.76771892 | 5365.679 |
| 48.78471892 | 5181.564 |
| 48.80171892 | 5075.916 |
| 48.81871892 | 4878.07 |
| 48.83571892 | 4713.407 |
| 48.85271892 | 4593.72 |
| 48.86971892 | 4470.309 |
| 48.88671892 | 4240.41 |
| 48.90371892 | 3910.488 |
| 48.92071892 | 3644.198 |
| 48.93771892 | 3359.09 |
| 48.95471892 | 3116.599 |
| 48.97171892 | 2897.436 |
| 48.98871892 | 2735.825 |
| 49.00571892 | 2569.11 |
| 49.02271892 | 2413.972 |
| 49.03971892 | 2270.769 |
| 49.05671892 | 2135.576 |
| 49.07371892 | 2029.17 |
| 49.09071892 | 1976.324 |
| 49.10771892 | 2021.237 |
| 49.12471892 | 2005.8 |
| 49.14171892 | 1887.918 |
| 49.15871892 | 1844.617 |
| 49.17571892 | 1804.733 |
| 49.19271892 | 1742.944 |
| 49.20971892 | 1736.263 |
| 49.22671892 | 1671.968 |
| 49.24371892 | 1644.521 |
| 49.26071892 | 1688.237 |
| 49.27771892 | 1682.963 |
| 49.29471892 | 1703.467 |
| 49.31171892 | 1640.416 |
| 49.32871892 | 1663.169 |
| 49.34571892 | 1659.405 |
| 49.36271892 | 1749.286 |
| 49.37971892 | 1747.513 |
| 49.39671892 | 1664.657 |
| 49.41371892 | 1619.977 |
| 49.43071892 | 1641.854 |
| 49.44771892 | 1577.398 |
| 49.46471892 | 1657.621 |
| 49.48171892 | 1672.547 |
| 49.49871892 | 1710.802 |
| 49.51571892 | 1769.325 |
| 49.53271892 | 1837.608 |
| 49.54971892 | 1921.431 |
| 49.56671892 | 2212.514 |
| 49.58371892 | 2428.839 |
| 49.60071892 | 2588.999 |
| 49.61771892 | 2675.379 |
| 49.63471892 | 2481.429 |
| 49.65171892 | 2168.203 |
| 49.66871892 | 1932.384 |
| 49.68571892 | 1896.083 |
| 49.70271892 | 1965.075 |
| 49.71971892 | 2046.382 |
| 49.73671892 | 2147.608 |
| 49.75371892 | 2089.725 |
| 49.77071892 | 1856.65 |
| 49.78771892 | 1617.306 |
| 49.80471892 | 1411.348 |
| 49.82171892 | 1376.505 |
| 49.83871892 | 1410.136 |
| 49.85571892 | 1375.93 |
| 49.87271892 | 1346.119 |
| 49.88971892 | 1271.254 |
| 49.90671892 | 1286.522 |
| 49.92371892 | 1289.104 |
| 49.94071892 | 1323.468 |
| 49.95771892 | 1336.632 |
| 49.97471892 | 1295.63 |
| 49.99171892 | 1201.216 |
| 50.00871892 | 1247.647 |
| 50.02571892 | 1303.517 |
| 50.04271892 | 1184.593 |
| 50.05971892 | 1118.871 |
| 50.07671892 | 1165.809 |
| 50.09371892 | 1295.779 |
| 50.11071892 | 1296.373 |
| 50.12771892 | 1241.979 |
| 50.14471892 | 1296.746 |
| 50.16171892 | 1293.835 |
| 50.17871892 | 1289.026 |
| 50.19571892 | 1332.014 |
| 50.21271892 | 1293.613 |
| 50.22971892 | 1324.722 |
| 50.24671892 | 1436.699 |
| 50.26371892 | 1420.161 |
| 50.28071892 | 1359.965 |
| 50.29771892 | 1321.651 |
| 50.31471892 | 1375.828 |
| 50.33171892 | 1388.695 |
| 50.34871892 | 1353.138 |
| 50.36571892 | 1401.844 |
| 50.38271892 | 1463.966 |
| 50.39971892 | 1471.243 |
| 50.41671892 | 1385.578 |
| 50.43371892 | 1416.063 |
| 50.45071892 | 1572.354 |
| 50.46771892 | 1632.358 |
| 50.48471892 | 1684.096 |
| 50.50171892 | 1765.914 |
| 50.51871892 | 1906.16 |
| 50.53571892 | 2083.465 |
| 50.55271892 | 2290.264 |
| 50.56971892 | 2453.347 |
| 50.58671892 | 2624.449 |
| 50.60371892 | 2736.408 |
| 50.62071892 | 2601.534 |
| 50.63771892 | 2672.877 |
| 50.65471892 | 2631.578 |
| 50.67171892 | 2662.303 |
| 50.68871892 | 2764.894 |
| 50.70571892 | 2809.799 |
| 50.72271892 | 2785.058 |
| 50.73971892 | 2476.446 |
| 50.75671892 | 2361.588 |
| 50.77371892 | 2300.194 |
| 50.79071892 | 2110.722 |
| 50.80771892 | 2080.15 |
| 50.82471892 | 2097.58 |
| 50.84171892 | 2005.517 |
| 50.85871892 | 1943.163 |
| 50.87571892 | 1852.436 |
| 50.89271892 | 1751.836 |
| 50.90971892 | 1638.71 |
| 50.92671892 | 1560.559 |
| 50.94371892 | 1565.61 |
| 50.96071892 | 1581.325 |
| 50.97771892 | 1590.545 |
| 50.99471892 | 1625.35 |
| 51.01171892 | 1663.491 |
| 51.02871892 | 1716.023 |
| 51.04571892 | 1784.876 |
| 51.06271892 | 1933.697 |
| 51.07971892 | 2135.185 |
| 51.09671892 | 2392.2 |
| 51.11371892 | 2691.063 |
| 51.13071892 | 2971.71 |
| 51.14771892 | 3165.095 |
| 51.16471892 | 3177.168 |
| 51.18171892 | 3042.4 |
| 51.19871892 | 2845.155 |
| 51.21571892 | 2660.773 |
| 51.23271892 | 2565.805 |
| 51.24971892 | 2522.425 |
| 51.26671892 | 2562.287 |
| 51.28371892 | 2571.527 |
| 51.30071892 | 2605.621 |
| 51.31771892 | 2526.833 |
| 51.33471892 | 2368.495 |
| 51.35171892 | 2258.645 |
| 51.36871892 | 2028.121 |
| 51.38571892 | 1974.436 |
| 51.40271892 | 1840.288 |
| 51.41971892 | 1813.63 |
| 51.43671892 | 1789.277 |
| 51.45371892 | 1839.031 |
| 51.47071892 | 1994.436 |
| 51.48771892 | 1979.933 |
| 51.50471892 | 1979.603 |
| 51.52171892 | 1947.14 |
| 51.53871892 | 1789.937 |
| 51.55571892 | 1643.908 |
| 51.57271892 | 1568.872 |
| 51.58971892 | 1508.685 |
| 51.60671892 | 1488.408 |
| 51.62371892 | 1505.51 |
| 51.64071892 | 1548.903 |
| 51.65771892 | 1518.39 |
| 51.67471892 | 1412.899 |
| 51.69171892 | 1293.045 |
| 51.70871892 | 1268.127 |
| 51.72571892 | 1210.953 |
| 51.74271892 | 1141.956 |
| 51.75971892 | 1149.072 |
| 51.77671892 | 1166.028 |
| 51.79371892 | 1156.757 |
| 51.81071892 | 1142.063 |
| 51.82771892 | 1135.656 |
| 51.84471892 | 1086.314 |
| 51.86171892 | 1048.697 |
| 51.87871892 | 1072.547 |
| 51.89571892 | 1041.759 |
| 51.91271892 | 1071.454 |
| 51.92971892 | 1104.536 |
| 51.94671892 | 1083.52 |
| 51.96371892 | 1036.967 |
| 51.98071892 | 1134.198 |
| 51.99771892 | 1130.367 |
| 52.01471892 | 1140.428 |
| 52.03171892 | 1072.459 |
| 52.04871892 | 1003.47 |
| 52.06571892 | 1148.205 |
| 52.08271892 | 1139.102 |
| 52.09971892 | 1244.673 |
| 52.11671892 | 1163.715 |
| 52.13371892 | 1170.075 |
| 52.15071892 | 1142.365 |
| 52.16771892 | 1257.015 |
| 52.18471892 | 1282.629 |
| 52.20171892 | 1481.927 |
| 52.21871892 | 1564.402 |
| 52.23571892 | 1820.768 |
| 52.25271892 | 1949.376 |
| 52.26971892 | 1981.205 |
| 52.28671892 | 1842.333 |
| 52.30371892 | 1705.563 |
| 52.32071892 | 1559.138 |
| 52.33771892 | 1524.874 |
| 52.35471892 | 1542.342 |
| 52.37171892 | 1616.42 |
| 52.38871892 | 1638.59 |
| 52.40571892 | 1611.484 |
| 52.42271892 | 1581.615 |
| 52.43971892 | 1438.295 |
| 52.45671892 | 1329.185 |
| 52.47371892 | 1343.085 |
| 52.49071892 | 1267.471 |
| 52.50771892 | 1213.359 |
| 52.52471892 | 1200.332 |
| 52.54171892 | 1133.02 |
| 52.55871892 | 1169.547 |
| 52.57571892 | 1113.076 |
| 52.59271892 | 1058.798 |
| 52.60971892 | 1023.617 |
| 52.62671892 | 1150.057 |
| 52.64371892 | 1104.598 |
| 52.66071892 | 1171.463 |
| 52.67771892 | 991.987 |
| 52.69471892 | 1051.182 |
| 52.71171892 | 999.5 |
| 52.72871892 | 1003.235 |
| 52.74571892 | 1103.391 |
| 52.76271892 | 1166.19 |
| 52.77971892 | 1166.19 |
| 52.79671892 | 1092.858 |
| 52.81371892 | 1028.148 |
| 52.83071892 | 1047.002 |
| 52.84771892 | 1074.22 |
| 52.86471892 | 988.155 |
| 52.88171892 | 1000.468 |
| 52.89871892 | 1076.238 |
| 52.91571892 | 991.128 |
| 52.93271892 | 1022.761 |
| 52.94971892 | 1042.825 |
| 52.96671892 | 1044.031 |
| 52.98371892 | 1115.178 |
| 53.00071892 | 1117.772 |
| 53.01771892 | 1062.672 |
| 53.03471892 | 1060.003 |
| 53.05171892 | 1147.779 |
| 53.06871892 | 1119.13 |
| 53.08571892 | 1063.463 |
| 53.10271892 | 1060.342 |
| 53.11971892 | 1117.709 |
| 53.13671892 | 1164.877 |
| 53.15371892 | 1200.309 |
| 53.17071892 | 1259.277 |
| 53.18771892 | 1298.916 |
| 53.20471892 | 1421.639 |
| 53.22171892 | 1567.047 |
| 53.23871892 | 1708.734 |
| 53.25571892 | 1782.6 |
| 53.27271892 | 1676.348 |
| 53.28971892 | 1596.159 |
| 53.30671892 | 1386.952 |
| 53.32371892 | 1300.754 |
| 53.34071892 | 1322.073 |
| 53.35771892 | 1398.806 |
| 53.37471892 | 1361.993 |
| 53.39171892 | 1453.9 |
| 53.40871892 | 1465.084 |
| 53.42571892 | 1447.098 |
| 53.44271892 | 1402.407 |
| 53.45971892 | 1345.646 |
| 53.47671892 | 1208.618 |
| 53.49371892 | 1227.477 |
| 53.51071892 | 1280.151 |
| 53.52771892 | 1263.453 |
| 53.54471892 | 1301.677 |
| 53.56171892 | 1203.404 |
| 53.57871892 | 1240.689 |
| 53.59571892 | 1246.641 |
| 53.61271892 | 1141.858 |
| 53.62971892 | 1158.284 |
| 53.64671892 | 1137.416 |
| 53.66371892 | 1081.568 |
| 53.68071892 | 1100.117 |
| 53.69771892 | 1138.007 |
| 53.71471892 | 1127.17 |
| 53.73171892 | 1083.843 |
| 53.74871892 | 1068.348 |
| 53.76571892 | 1062.2 |
| 53.78271892 | 1117.991 |
| 53.79971892 | 1092.081 |
| 53.81671892 | 1006.995 |
| 53.83371892 | 961.104 |
| 53.85071892 | 930.156 |
| 53.86771892 | 988.864 |
| 53.88471892 | 1040.133 |
| 53.90171892 | 1099.629 |
| 53.91871892 | 1058.983 |
| 53.93571892 | 1010.948 |
| 53.95271892 | 987.624 |
| 53.96971892 | 1014.806 |
| 53.98671892 | 928.464 |
| 54.00371892 | 1056.934 |
| 54.02071892 | 1161.182 |
| 54.03771892 | 1034.498 |
| 54.05471892 | 977.661 |
| 54.07171892 | 995.424 |
| 54.08871892 | 951.47 |
| 54.10571892 | 990.572 |
| 54.12271892 | 1005.464 |
| 54.13971892 | 1034.143 |
| 54.15671892 | 981.716 |
| 54.17371892 | 925.488 |
| 54.19071892 | 1038.694 |
| 54.20771892 | 1035.996 |
| 54.22471892 | 1075.422 |
| 54.24171892 | 1038.064 |
| 54.25871892 | 989.186 |
| 54.27571892 | 1030.873 |
| 54.29271892 | 1040.361 |
| 54.30971892 | 995.603 |
| 54.32671892 | 1046.799 |
| 54.34371892 | 1072.381 |
| 54.36071892 | 1053.628 |
| 54.37771892 | 1065.248 |
| 54.39471892 | 1039.302 |
| 54.41171892 | 1076.851 |
| 54.42871892 | 1107.899 |
| 54.44571892 | 1097.548 |
| 54.46271892 | 1114.049 |
| 54.47971892 | 1137.832 |
| 54.49671892 | 1138.461 |
| 54.51371892 | 1173.228 |
| 54.53071892 | 1206.039 |
| 54.54771892 | 1140.483 |
| 54.56471892 | 1097.077 |
| 54.58171892 | 1107.21 |
| 54.59871892 | 1049.392 |
| 54.61571892 | 1042.067 |
| 54.63271892 | 1055.093 |
| 54.64971892 | 1039.847 |
| 54.66671892 | 1155.638 |
| 54.68371892 | 1197.392 |
| 54.70071892 | 1193.33 |
| 54.71771892 | 1143.005 |
| 54.73471892 | 1182.706 |
| 54.75171892 | 1142.652 |
| 54.76871892 | 1121.946 |
| 54.78571892 | 1109.918 |
| 54.80271892 | 1010.756 |
| 54.81971892 | 1076.156 |
| 54.83671892 | 1045.324 |
| 54.85371892 | 1087.947 |
| 54.87071892 | 1090.871 |
| 54.88771892 | 1169.28 |
| 54.90471892 | 1063.818 |
| 54.92171892 | 1109.998 |
| 54.93871892 | 1115.251 |
| 54.95571892 | 1081.338 |
| 54.97271892 | 1120.926 |
| 54.98971892 | 1116.187 |
| 55.00671892 | 1128.104 |
| 55.02371892 | 1159.662 |
| 55.04071892 | 1153.427 |
| 55.05771892 | 1113.621 |
| 55.07471892 | 1035.338 |
| 55.09171892 | 1054.894 |
| 55.10871892 | 1056.433 |
| 55.12571892 | 1080.556 |
| 55.14271892 | 1080.792 |
| 55.15971892 | 1034.408 |
| 55.17671892 | 1071.48 |
| 55.19371892 | 1053.454 |
| 55.21071892 | 1008.817 |
| 55.22771892 | 1052.125 |
| 55.24471892 | 1041.322 |
| 55.26171892 | 1044.021 |
| 55.27871892 | 1060.216 |
| 55.29571892 | 1105.427 |
| 55.31271892 | 1053.291 |
| 55.32971892 | 1107.408 |
| 55.34671892 | 1028.749 |
| 55.36371892 | 1045.782 |
| 55.38071892 | 1052.065 |
| 55.39771892 | 1052.267 |
| 55.41471892 | 1104.536 |
| 55.43171892 | 1100.416 |
| 55.44871892 | 1052.2 |
| 55.46571892 | 1030.192 |
| 55.48271892 | 1048.393 |
| 55.49971892 | 991.03 |
| 55.51671892 | 1099.86 |
| 55.53371892 | 1083.237 |
| 55.55071892 | 1110.621 |
| 55.56771892 | 1081.417 |
| 55.58471892 | 1044.735 |
| 55.60171892 | 1070.757 |
| 55.61871892 | 1106.576 |
| 55.63571892 | 1085.125 |
| 55.65271892 | 1097.894 |
| 55.66971892 | 1046.766 |
| 55.68671892 | 1065.23 |
| 55.70371892 | 1049.721 |
| 55.72071892 | 1098.957 |
| 55.73771892 | 1065.343 |
| 55.75471892 | 1033.521 |
| 55.77171892 | 1039.23 |
| 55.78871892 | 1063.004 |
| 55.80571892 | 1079.212 |
| 55.82271892 | 1069.975 |
| 55.83971892 | 1035.569 |
| 55.85671892 | 1036.186 |
| 55.87371892 | 1105.92 |
| 55.89071892 | 1171.582 |
| 55.90771892 | 1157.555 |
| 55.92471892 | 1045.303 |
| 55.94171892 | 1035.418 |
| 55.95871892 | 1136.736 |
| 55.97571892 | 1141.601 |
| 55.99271892 | 1129.265 |
| 56.00971892 | 1174.526 |
| 56.02671892 | 1278.679 |
| 56.04371892 | 1378.415 |
| 56.06071892 | 1452.597 |
| 56.07771892 | 1418.748 |
| 56.09471892 | 1448.781 |
| 56.11171892 | 1436.999 |
| 56.12871892 | 1321.197 |
| 56.14571892 | 1147.486 |
| 56.16271892 | 1244.85 |
| 56.17971892 | 1196.939 |
| 56.19671892 | 1276.74 |
| 56.21371892 | 1291.444 |
| 56.23071892 | 1285.282 |
| 56.24771892 | 1287.934 |
| 56.26471892 | 1295.008 |
| 56.28171892 | 1189.67 |
| 56.29871892 | 1271.476 |
| 56.31571892 | 1212.53 |
| 56.33271892 | 1184.264 |
| 56.34971892 | 1186.283 |
| 56.36671892 | 1239.471 |
| 56.38371892 | 1228.341 |
| 56.40071892 | 1241.633 |
| 56.41771892 | 1246.976 |
| 56.43471892 | 1248.213 |
| 56.45171892 | 1243.768 |
| 56.46871892 | 1272.066 |
| 56.48571892 | 1314.081 |
| 56.50271892 | 1347.249 |
| 56.51971892 | 1355.251 |
| 56.53671892 | 1427.855 |
| 56.55371892 | 1492.616 |
| 56.57071892 | 1449.831 |
| 56.58771892 | 1471.401 |
| 56.60471892 | 1515.26 |
| 56.62171892 | 1522.747 |
| 56.63871892 | 1512.592 |
| 56.65571892 | 1648.379 |
| 56.67271892 | 1766.303 |
| 56.68971892 | 1875.08 |
| 56.70671892 | 1951.285 |
| 56.72371892 | 2115.777 |
| 56.74071892 | 2124.901 |
| 56.75771892 | 2217.401 |
| 56.77471892 | 2348.436 |
| 56.79171892 | 2320.438 |
| 56.80871892 | 2334.366 |
| 56.82571892 | 2372.214 |
| 56.84271892 | 2349.502 |
| 56.85971892 | 2288.603 |
| 56.87671892 | 2236.605 |
| 56.89371892 | 2250.302 |
| 56.91071892 | 2199.202 |
| 56.92771892 | 2187.192 |
| 56.94471892 | 2129.345 |
| 56.96171892 | 2103.373 |
| 56.97871892 | 2146.956 |
| 56.99571892 | 2044.751 |
| 57.01271892 | 1991.295 |
| 57.02971892 | 1968.499 |
| 57.04671892 | 1976.304 |
| 57.06371892 | 1982.423 |
| 57.08071892 | 1873.348 |
| 57.09771892 | 1765.871 |
| 57.11471892 | 1671.291 |
| 57.13171892 | 1608.896 |
| 57.14871892 | 1605.406 |
| 57.16571892 | 1615.682 |
| 57.18271892 | 1674.413 |
| 57.19971892 | 1789.432 |
| 57.21671892 | 1786.1 |
| 57.23371892 | 1720.465 |
| 57.25071892 | 1771.245 |
| 57.26771892 | 1805.143 |
| 57.28471892 | 1799.484 |
| 57.30171892 | 1803.389 |
| 57.31871892 | 1790.62 |
| 57.33571892 | 1625.904 |
| 57.35271892 | 1715.413 |
| 57.36971892 | 1715.873 |
| 57.38671892 | 1764.618 |
| 57.40371892 | 1868.313 |
| 57.42071892 | 1909.775 |
| 57.43771892 | 1928.092 |
| 57.45471892 | 1989.673 |
| 57.47171892 | 2098.166 |
| 57.48871892 | 2320.39 |
| 57.50571892 | 2389.495 |
| 57.52271892 | 2589.223 |
| 57.53971892 | 2716.37 |
| 57.55671892 | 2776.961 |
| 57.57371892 | 3033.181 |
| 57.59071892 | 3218.357 |
| 57.60771892 | 3325.958 |
| 57.62471892 | 3471.683 |
| 57.64171892 | 3406.784 |
| 57.65871892 | 3396.096 |
| 57.67571892 | 3250.644 |
| 57.69271892 | 3169.711 |
| 57.70971892 | 3007.289 |
| 57.72671892 | 2924.941 |
| 57.74371892 | 2893.635 |
| 57.76071892 | 2964.047 |
| 57.77771892 | 2904.93 |
| 57.79471892 | 2810.701 |
| 57.81171892 | 2715.85 |
| 57.82871892 | 2573.09 |
| 57.84571892 | 2438.216 |
| 57.86271892 | 2276.565 |
| 57.87971892 | 2138.521 |
| 57.89671892 | 2069.047 |
| 57.91371892 | 1984.522 |
| 57.93071892 | 1856.426 |
| 57.94771892 | 1722.792 |
| 57.96471892 | 1718.69 |
| 57.98171892 | 1725.648 |
| 57.99871892 | 1698.063 |
| 58.01571892 | 1650.689 |
| 58.03271892 | 1615.437 |
| 58.04971892 | 1598.697 |
| 58.06671892 | 1493.63 |
| 58.08371892 | 1466.288 |
| 58.10071892 | 1483.434 |
| 58.11771892 | 1579.922 |
| 58.13471892 | 1544.502 |
| 58.15171892 | 1531.409 |
| 58.16871892 | 1556.793 |
| 58.18571892 | 1585.853 |
| 58.20271892 | 1684.234 |
| 58.21971892 | 1606.09 |
| 58.23671892 | 1677.588 |
| 58.25371892 | 1772.268 |
| 58.27071892 | 1775.447 |
| 58.28771892 | 1858.091 |
| 58.30471892 | 1848.265 |
| 58.32171892 | 1799.218 |
| 58.33871892 | 1817.296 |
| 58.35571892 | 1886.573 |
| 58.37271892 | 1787.216 |
| 58.38971892 | 1805.887 |
| 58.40671892 | 1803.776 |
| 58.42371892 | 1795.346 |
| 58.44071892 | 1770.382 |
| 58.45771892 | 1656.122 |
| 58.47471892 | 1683.986 |
| 58.49171892 | 1650.294 |
| 58.50871892 | 1637 |
| 58.52571892 | 1630.957 |
| 58.54271892 | 1552.895 |
| 58.55971892 | 1485.466 |
| 58.57671892 | 1397.323 |
| 58.59371892 | 1354.945 |
| 58.61071892 | 1339.832 |
| 58.62771892 | 1316.343 |
| 58.64471892 | 1303.756 |
| 58.66171892 | 1300.457 |
| 58.67871892 | 1337.415 |
| 58.69571892 | 1362.858 |
| 58.71271892 | 1345.282 |
| 58.72971892 | 1298.593 |
| 58.74671892 | 1322.548 |
| 58.76371892 | 1382.145 |
| 58.78071892 | 1353.8 |
| 58.79771892 | 1275.419 |
| 58.81471892 | 1178.648 |
| 58.83171892 | 1307.566 |
| 58.84871892 | 1362.902 |
| 58.86571892 | 1337.157 |
| 58.88271892 | 1266.001 |
| 58.89971892 | 1298.627 |
| 58.91671892 | 1356.334 |
| 58.93371892 | 1509.228 |
| 58.95071892 | 1398.976 |
| 58.96771892 | 1469.483 |
| 58.98471892 | 1469.101 |
| 59.00171892 | 1421.424 |
| 59.01871892 | 1497.022 |
| 59.03571892 | 1429.747 |
| 59.05271892 | 1405.236 |
| 59.06971892 | 1334.692 |
| 59.08671892 | 1380.308 |
| 59.10371892 | 1385.97 |
| 59.12071892 | 1260.31 |
| 59.13771892 | 1282.681 |
| 59.15471892 | 1311.469 |
| 59.17171892 | 1255.004 |
| 59.18871892 | 1242.047 |
| 59.20571892 | 1284.981 |
| 59.22271892 | 1264.585 |
| 59.23971892 | 1208.651 |
| 59.25671892 | 1227.314 |
| 59.27371892 | 1225.759 |
| 59.29071892 | 1165.921 |
| 59.30771892 | 1144.552 |
| 59.32471892 | 1144.552 |
| 59.34171892 | 1136.463 |
| 59.35871892 | 1105.331 |
| 59.37571892 | 1063.949 |
| 59.39271892 | 1039.23 |
| 59.40971892 | 1042.215 |
| 59.42671892 | 1068.147 |
| 59.44371892 | 1136.904 |
| 59.46071892 | 1154.836 |
| 59.47771892 | 1080 |
| 59.49471892 | 1106.012 |
| 59.51171892 | 1119.476 |
| 59.52871892 | 1071.078 |
| 59.54571892 | 1169.805 |
| 59.56271892 | 1060.528 |
| 59.57971892 | 1071.765 |
| 59.59671892 | 1127.394 |
| 59.61371892 | 1094.751 |
| 59.63071892 | 1149.827 |
| 59.64771892 | 1164.951 |
| 59.66471892 | 1221.832 |
| 59.68171892 | 1189.665 |
| 59.69871892 | 1258.992 |
| 59.71571892 | 1163.206 |
| 59.73271892 | 1291.827 |
| 59.74971892 | 1276.586 |
| 59.76671892 | 1308.875 |
| 59.78371892 | 1378.876 |
| 59.80071892 | 1442.09 |
| 59.81771892 | 1502.933 |
| 59.83471892 | 1552.776 |
| 59.85171892 | 1640.642 |
| 59.86871892 | 1749.428 |
| 59.88571892 | 1851.102 |
| 59.90271892 | 1888.734 |
| 59.91971892 | 1857.687 |
| 59.93671892 | 1823.257 |
| 59.95371892 | 1780.246 |
| 59.97071892 | 1692.493 |
| 59.98771892 | 1602.207 |
| 60.00471892 | 1609.301 |
| 60.02171892 | 1672.713 |
| 60.03871892 | 1774.644 |
| 60.05571892 | 1720.534 |
| 60.07271892 | 1740.435 |
| 60.08971892 | 1704.675 |
| 60.10671892 | 1520.085 |
| 60.12371892 | 1528.765 |
| 60.14071892 | 1511.679 |
| 60.15771892 | 1667.195 |
| 60.17471892 | 1614.365 |
| 60.19171892 | 1635.479 |
| 60.20871892 | 1602.875 |
| 60.22571892 | 1476.476 |
| 60.24271892 | 1473.171 |
| 60.25971892 | 1473.092 |
| 60.27671892 | 1392.251 |
| 60.29371892 | 1401.81 |
| 60.31071892 | 1400.442 |
| 60.32771892 | 1406.067 |
| 60.34471892 | 1398.291 |
| 60.36171892 | 1458.156 |
| 60.37871892 | 1438.449 |
| 60.39571892 | 1266.707 |
| 60.41271892 | 1237.969 |
| 60.42971892 | 1282.212 |
| 60.44671892 | 1319.39 |
| 60.46371892 | 1340.154 |
| 60.48071892 | 1288.388 |
| 60.49771892 | 1233.69 |
| 60.51471892 | 1302.692 |
| 60.53171892 | 1380.214 |
| 60.54871892 | 1346.682 |
| 60.56571892 | 1360.111 |
| 60.58271892 | 1479.98 |
| 60.59971892 | 1525.475 |
| 60.61671892 | 1539.098 |
| 60.63371892 | 1615.503 |
| 60.65071892 | 1661.304 |
| 60.66771892 | 1654.298 |
| 60.68471892 | 1672.602 |
| 60.70171892 | 1806.596 |
| 60.71871892 | 1867.029 |
| 60.73571892 | 1949.273 |
| 60.75271892 | 2015.058 |
| 60.76971892 | 2106.939 |
| 60.78671892 | 2236.712 |
| 60.80371892 | 2410.318 |
| 60.82071892 | 2452.941 |
| 60.83771892 | 2521.19 |
| 60.85471892 | 2678.499 |
| 60.87171892 | 2938.661 |
| 60.88871892 | 2958.957 |
| 60.90571892 | 2998.233 |
| 60.92271892 | 3012.892 |
| 60.93971892 | 2980.112 |
| 60.95671892 | 2887.063 |
| 60.97371892 | 2769.66 |
| 60.99071892 | 2778.862 |
| 61.00771892 | 2765.293 |
| 61.02471892 | 2815.285 |
| 61.04171892 | 2714.52 |
| 61.05871892 | 2758.84 |
| 61.07571892 | 2795.015 |
| 61.09271892 | 2747.995 |
| 61.10971892 | 2692.958 |
| 61.12671892 | 2751.846 |
| 61.14371892 | 2679.954 |
| 61.16071892 | 2696.253 |
| 61.17771892 | 2734.647 |
| 61.19471892 | 2819.961 |
| 61.21171892 | 2951.59 |
| 61.22871892 | 3004.13 |
| 61.24571892 | 3034.506 |
| 61.26271892 | 3032.788 |
| 61.27971892 | 2950.073 |
| 61.29671892 | 2886.555 |
| 61.31371892 | 2844.371 |
| 61.33071892 | 2754.854 |
| 61.34771892 | 2654.03 |
| 61.36471892 | 2603.743 |
| 61.38171892 | 2626.097 |
| 61.39871892 | 2602.666 |
| 61.41571892 | 2630.589 |
| 61.43271892 | 2618.064 |
| 61.44971892 | 2551.354 |
| 61.46671892 | 2442.792 |
| 61.48371892 | 2371.345 |
| 61.50071892 | 2438.805 |
| 61.51771892 | 2348.221 |
| 61.53471892 | 2259.105 |
| 61.55171892 | 2360.723 |
| 61.56871892 | 2420.857 |
| 61.58571892 | 2426.89 |
| 61.60271892 | 2503.505 |
| 61.61971892 | 2505.993 |
| 61.63671892 | 2489.457 |
| 61.65371892 | 2487.971 |
| 61.67071892 | 2399.207 |
| 61.68771892 | 2311.834 |
| 61.70471892 | 2243.832 |
| 61.72171892 | 2155.746 |
| 61.73871892 | 2179.861 |
| 61.75571892 | 2230.079 |
| 61.77271892 | 2308.922 |
| 61.78971892 | 2292.658 |
| 61.80671892 | 2251.664 |
| 61.82371892 | 2167.76 |
| 61.84071892 | 2090.941 |
| 61.85771892 | 1976.717 |
| 61.87471892 | 1828.714 |
| 61.89171892 | 1738.795 |
| 61.90871892 | 1728.041 |
| 61.92571892 | 1723.631 |
| 61.94271892 | 1668.802 |
| 61.95971892 | 1623.086 |
| 61.97671892 | 1632.464 |
| 61.99371892 | 1620.431 |
| 62.01071892 | 1556.373 |
| 62.02771892 | 1496.453 |
| 62.04471892 | 1474.346 |
| 62.06171892 | 1457.802 |
| 62.07871892 | 1433.841 |
| 62.09571892 | 1454.095 |
| 62.11271892 | 1442.405 |
| 62.12971892 | 1327.948 |
| 62.14671892 | 1291.55 |
| 62.16371892 | 1331.372 |
| 62.18071892 | 1349.174 |
| 62.19771892 | 1264.132 |
| 62.21471892 | 1300.1 |
| 62.23171892 | 1351.712 |
| 62.24871892 | 1228.198 |
| 62.26571892 | 1183.737 |
| 62.28271892 | 1219.316 |
| 62.29971892 | 1205.179 |
| 62.31671892 | 1149.832 |
| 62.33371892 | 1290.482 |
| 62.35071892 | 1239.899 |
| 62.36771892 | 1262.464 |
| 62.38471892 | 1158.317 |
| 62.40171892 | 1152.074 |
| 62.41871892 | 1199.653 |
| 62.43571892 | 1184.739 |
| 62.45271892 | 1233.904 |
| 62.46971892 | 1206.753 |
| 62.48671892 | 1229.88 |
| 62.50371892 | 1235.067 |
| 62.52071892 | 1224.745 |
| 62.53771892 | 1274.081 |
| 62.55471892 | 1301.208 |
| 62.57171892 | 1358.83 |
| 62.58871892 | 1381.348 |
| 62.60571892 | 1400.495 |
| 62.62271892 | 1436.342 |
| 62.63971892 | 1436.538 |
| 62.65671892 | 1433.246 |
| 62.67371892 | 1408.251 |
| 62.69071892 | 1426.339 |
| 62.70771892 | 1388.875 |
| 62.72471892 | 1295.888 |
| 62.74171892 | 1316.924 |
| 62.75871892 | 1356.78 |
| 62.77571892 | 1385.223 |
| 62.79271892 | 1413.094 |
| 62.80971892 | 1423.602 |
| 62.82671892 | 1414.833 |
| 62.84371892 | 1605.15 |
| 62.86071892 | 1461.474 |
| 62.87771892 | 1358.518 |
| 62.89471892 | 1300.23 |
| 62.91171892 | 1303.708 |
| 62.92871892 | 1299.706 |
| 62.94571892 | 1269.348 |
| 62.96271892 | 1242.114 |
| 62.97971892 | 1400.143 |
| 62.99671892 | 1361.482 |
| 63.01371892 | 1398.185 |
| 63.03071892 | 1315.108 |
| 63.04771892 | 1347.245 |
| 63.06471892 | 1356.466 |
| 63.08171892 | 1341.947 |
| 63.09871892 | 1420.401 |
| 63.11571892 | 1500.446 |
| 63.13271892 | 1486.891 |
| 63.14971892 | 1699.202 |
| 63.16671892 | 1790.765 |
| 63.18371892 | 1883.641 |
| 63.20071892 | 1947.446 |
| 63.21771892 | 1994.324 |
| 63.23471892 | 1994.613 |
| 63.25171892 | 2003.115 |
| 63.26871892 | 2004.626 |
| 63.28571892 | 1965.23 |
| 63.30271892 | 1976.144 |
| 63.31971892 | 1993.448 |
| 63.33671892 | 1999.416 |
| 63.35371892 | 2035.637 |
| 63.37071892 | 1999.153 |
| 63.38771892 | 1968.719 |
| 63.40471892 | 2025.878 |
| 63.42171892 | 2010.535 |
| 63.43871892 | 2078.715 |
| 63.45571892 | 2045.648 |
| 63.47271892 | 2082.074 |
| 63.48971892 | 2105.661 |
| 63.50671892 | 2068.282 |
| 63.52371892 | 2087.562 |
| 63.54071892 | 2121.604 |
| 63.55771892 | 1881.634 |
| 63.57471892 | 1756.263 |
| 63.59171892 | 1726.794 |
| 63.60871892 | 1649.069 |
| 63.62571892 | 1616.227 |
| 63.64271892 | 1737.998 |
| 63.65971892 | 1692.136 |
| 63.67671892 | 1701.54 |
| 63.69371892 | 1658.451 |
| 63.71071892 | 1634.069 |
| 63.72771892 | 1470.491 |
| 63.74471892 | 1530.2 |
| 63.76171892 | 1464.605 |
| 63.77871892 | 1368.917 |
| 63.79571892 | 1306.882 |
| 63.81271892 | 1391.932 |
| 63.82971892 | 1415.092 |
| 63.84671892 | 1362.279 |
| 63.86371892 | 1330.843 |
| 63.88071892 | 1310.633 |
| 63.89771892 | 1293.31 |
| 63.91471892 | 1231.325 |
| 63.93171892 | 1211.881 |
| 63.94871892 | 1253.093 |
| 63.96571892 | 1266.973 |
| 63.98271892 | 1319.229 |
| 63.99971892 | 1331.593 |
| 64.01671892 | 1315.637 |
| 64.03371892 | 1375.111 |
| 64.05071892 | 1409.319 |
| 64.06771892 | 1556.041 |
| 64.08471892 | 1642.663 |
| 64.10171892 | 1605.395 |
| 64.11871892 | 1412.513 |
| 64.13571892 | 1423.694 |
| 64.15271892 | 1364.495 |
| 64.16971892 | 1348.427 |
| 64.18671892 | 1386.08 |
| 64.20371892 | 1341.334 |
| 64.22071892 | 1434.873 |
| 64.23771892 | 1411.917 |
| 64.25471892 | 1547.545 |
| 64.27171892 | 1518.541 |
| 64.28871892 | 1590.665 |
| 64.30571892 | 1668.439 |
| 64.32271892 | 1656.04 |
| 64.33971892 | 1621.4 |
| 64.35671892 | 1584.914 |
| 64.37371892 | 1478.139 |
| 64.39071892 | 1497.338 |
| 64.40771892 | 1562.535 |
| 64.42471892 | 1569.714 |
| 64.44171892 | 1538.512 |
| 64.45871892 | 1688.143 |
| 64.47571892 | 1795.243 |
| 64.49271892 | 1856.583 |
| 64.50971892 | 2025.706 |
| 64.52671892 | 2273.581 |
| 64.54371892 | 2532.576 |
| 64.56071892 | 2658.15 |
| 64.57771892 | 2611.488 |
| 64.59471892 | 2499.429 |
| 64.61171892 | 2354.74 |
| 64.62871892 | 2270.454 |
| 64.64571892 | 2187.791 |
| 64.66271892 | 2093.423 |
| 64.67971892 | 2112.06 |
| 64.69671892 | 2149.788 |
| 64.71371892 | 2252.424 |
| 64.73071892 | 2447.399 |
| 64.74771892 | 2584.187 |
| 64.76471892 | 2564.778 |
| 64.78171892 | 2587.903 |
| 64.79871892 | 2648.722 |
| 64.81571892 | 2608.749 |
| 64.83271892 | 2629.688 |
| 64.84971892 | 2699.015 |
| 64.86671892 | 2837.362 |
| 64.88371892 | 2910.285 |
| 64.90071892 | 2924.814 |
| 64.91771892 | 2953.842 |
| 64.93471892 | 3028.233 |
| 64.95171892 | 2989.369 |
| 64.96871892 | 2723.141 |
| 64.98571892 | 2722.132 |
| 65.00271892 | 2583.006 |
| 65.01971892 | 2629.744 |
| 65.03671892 | 2535.598 |
| 65.05371892 | 2588.62 |
| 65.07071892 | 2604.579 |
| 65.08771892 | 2537.143 |
| 65.10471892 | 2509.253 |
| 65.12171892 | 2507.53 |
| 65.13871892 | 2390.827 |
| 65.15571892 | 2307.71 |
| 65.17271892 | 2298.86 |
| 65.18971892 | 2252.15 |
| 65.20671892 | 2234.334 |
| 65.22371892 | 2225.806 |
| 65.24071892 | 2178.882 |
| 65.25771892 | 2158.351 |
| 65.27471892 | 2099.463 |
| 65.29171892 | 2015.077 |
| 65.30871892 | 1942.177 |
| 65.32571892 | 1861 |
| 65.34271892 | 1792.602 |
| 65.35971892 | 1776.349 |
| 65.37671892 | 1789.112 |
| 65.39371892 | 1770.823 |
| 65.41071892 | 1784.219 |
| 65.42771892 | 1783.38 |
| 65.44471892 | 1801.414 |
| 65.46171892 | 1839.272 |
| 65.47871892 | 1751.067 |
| 65.49571892 | 1634.567 |
| 65.51271892 | 1670.487 |
| 65.52971892 | 1711.17 |
| 65.54671892 | 1666.046 |
| 65.56371892 | 1675.603 |
| 65.58071892 | 1677.793 |
| 65.59771892 | 1748.514 |
| 65.61471892 | 1734.767 |
| 65.63171892 | 1666.711 |
| 65.64871892 | 1796.211 |
| 65.66571892 | 1865.857 |
| 65.68271892 | 1890.706 |
| 65.69971892 | 1882.373 |
| 65.71671892 | 1996.457 |
| 65.73371892 | 2016.432 |
| 65.75071892 | 2175.95 |
| 65.76771892 | 2224.814 |
| 65.78471892 | 2144.321 |
| 65.80171892 | 2204.56 |
| 65.81871892 | 2344.383 |
| 65.83571892 | 2411.644 |
| 65.85271892 | 2574.857 |
| 65.86971892 | 2683.84 |
| 65.88671892 | 2733.815 |
| 65.90371892 | 2727.069 |
| 65.92071892 | 2600.716 |
| 65.93771892 | 2550.024 |
| 65.95471892 | 2488.629 |
| 65.97171892 | 2408.131 |
| 65.98871892 | 2340.093 |
| 66.00571892 | 2333.292 |
| 66.02271892 | 2356.551 |
| 66.03971892 | 2311.688 |
| 66.05671892 | 2329.762 |
| 66.07371892 | 2317.491 |
| 66.09071892 | 2271.21 |
| 66.10771892 | 2230.887 |
| 66.12471892 | 2192.743 |
| 66.14171892 | 2057.462 |
| 66.15871892 | 1936.377 |
| 66.17571892 | 1906.478 |
| 66.19271892 | 1754.242 |
| 66.20971892 | 1714.386 |
| 66.22671892 | 1655.201 |
| 66.24371892 | 1672.643 |
| 66.26071892 | 1655.921 |
| 66.27771892 | 1536.054 |
| 66.29471892 | 1579.457 |
| 66.31171892 | 1536.187 |
| 66.32871892 | 1533.011 |
| 66.34571892 | 1529.828 |
| 66.36271892 | 1619.031 |
| 66.37971892 | 1486.996 |
| 66.39671892 | 1417.844 |
| 66.41371892 | 1376.647 |
| 66.43071892 | 1295.799 |
| 66.44771892 | 1274.268 |
| 66.46471892 | 1257.241 |
| 66.48171892 | 1262.083 |
| 66.49871892 | 1250.267 |
| 66.51571892 | 1298.151 |
| 66.53271892 | 1344.859 |
| 66.54971892 | 1349.133 |
| 66.56671892 | 1425.722 |
| 66.58371892 | 1423.219 |
| 66.60071892 | 1397.04 |
| 66.61771892 | 1353.141 |
| 66.63471892 | 1311.215 |
| 66.65171892 | 1259.934 |
| 66.66871892 | 1188.163 |
| 66.68571892 | 1145.933 |
| 66.70271892 | 1105.491 |
| 66.71971892 | 1129.102 |
| 66.73671892 | 1209.59 |
| 66.75371892 | 1224.745 |
| 66.77071892 | 1235.635 |
| 66.78771892 | 1247.082 |
| 66.80471892 | 1230.543 |
| 66.82171892 | 1236.621 |
| 66.83871892 | 1191.955 |
| 66.85571892 | 1127.151 |
| 66.87271892 | 1157.361 |
| 66.88971892 | 1201.888 |
| 66.90671892 | 1138.092 |
| 66.92371892 | 1097.432 |
| 66.94071892 | 1109.026 |
| 66.95771892 | 1058.855 |
| 66.97471892 | 1074.3 |
| 66.99171892 | 1247.807 |
| 67.00871892 | 1102.637 |
| 67.02571892 | 1078.001 |
| 67.04271892 | 1106.943 |
| 67.05971892 | 1032.737 |
| 67.07671892 | 1119.412 |
| 67.09371892 | 1127.573 |
| 67.11071892 | 1137.973 |
| 67.12771892 | 1164.704 |
| 67.14471892 | 1200.178 |
| 67.16171892 | 1182.965 |
| 67.17871892 | 1123.757 |
| 67.19571892 | 1181.863 |
| 67.21271892 | 1166.561 |
| 67.22971892 | 1115.483 |
| 67.24671892 | 1136.725 |
| 67.26371892 | 1147.052 |
| 67.28071892 | 1140.175 |
| 67.29771892 | 1201.958 |
| 67.31471892 | 1305.178 |
| 67.33171892 | 1322.493 |
| 67.34871892 | 1254.494 |
| 67.36571892 | 1280.141 |
| 67.38271892 | 1359.64 |
| 67.39971892 | 1366.791 |
| 67.41671892 | 1406.771 |
| 67.43371892 | 1503.639 |
| 67.45071892 | 1590.467 |
| 67.46771892 | 1628.307 |
| 67.48471892 | 1619.105 |
| 67.50171892 | 1536.65 |
| 67.51871892 | 1485.298 |
| 67.53571892 | 1484.804 |
| 67.55271892 | 1403 |
| 67.56971892 | 1367.479 |
| 67.58671892 | 1378.814 |
| 67.60371892 | 1453.664 |
| 67.62071892 | 1455.794 |
| 67.63771892 | 1371.726 |
| 67.65471892 | 1382.663 |
| 67.67171892 | 1403.301 |
| 67.68871892 | 1339.318 |
| 67.70571892 | 1337.909 |
| 67.72271892 | 1320.439 |
| 67.73971892 | 1308.774 |
| 67.75671892 | 1327.673 |
| 67.77371892 | 1278.061 |
| 67.79071892 | 1405.166 |
| 67.80771892 | 1481.415 |
| 67.82471892 | 1542.029 |
| 67.84171892 | 1481.243 |
| 67.85871892 | 1415.46 |
| 67.87571892 | 1327.857 |
| 67.89271892 | 1203.981 |
| 67.90971892 | 1193.667 |
| 67.92671892 | 1115.389 |
| 67.94371892 | 1122.766 |
| 67.96071892 | 1197.935 |
| 67.97771892 | 1234.152 |
| 67.99471892 | 1253.429 |
| 68.01171892 | 1290.464 |
| 68.02871892 | 1319.091 |
| 68.04571892 | 1291.402 |
| 68.06271892 | 1243.329 |
| 68.07971892 | 1194.874 |
| 68.09671892 | 1160.323 |
| 68.11371892 | 1156.418 |
| 68.13071892 | 1094.346 |
| 68.14771892 | 1057.844 |
| 68.16471892 | 1102.052 |
| 68.18171892 | 1165.038 |
| 68.19871892 | 1131.936 |
| 68.21571892 | 1257.007 |
| 68.23271892 | 1293.849 |
| 68.24971892 | 1301.292 |
| 68.26671892 | 1192.152 |
| 68.28371892 | 1168.337 |
| 68.30071892 | 1186.168 |
| 68.31771892 | 1168.974 |
| 68.33471892 | 1139.411 |
| 68.35171892 | 1109.06 |
| 68.36871892 | 1193.707 |
| 68.38571892 | 1276.484 |
| 68.40271892 | 1262.449 |
| 68.41971892 | 1380.136 |
| 68.43671892 | 1247.129 |
| 68.45371892 | 1178.818 |
| 68.47071892 | 1194.857 |
| 68.48771892 | 1077.208 |
| 68.50471892 | 1098.213 |
| 68.52171892 | 1136.842 |
| 68.53871892 | 1157.127 |
| 68.55571892 | 1188.64 |
| 68.57271892 | 1191.553 |
| 68.58971892 | 1140.085 |
| 68.60671892 | 1146.638 |
| 68.62371892 | 1150.703 |
| 68.64071892 | 1091.394 |
| 68.65771892 | 1091.868 |
| 68.67471892 | 1110.794 |
| 68.69171892 | 1081.754 |
| 68.70871892 | 1051.843 |
| 68.72571892 | 1039.23 |
| 68.74271892 | 1071.245 |
| 68.75971892 | 1090.122 |
| 68.77671892 | 1095.124 |
| 68.79371892 | 1140.8 |
| 68.81071892 | 1101.462 |
| 68.82771892 | 1113.9 |
| 68.84471892 | 1126.175 |
| 68.86171892 | 1097.757 |
| 68.87871892 | 1080.675 |
| 68.89571892 | 1055.252 |
| 68.91271892 | 1100 |
| 68.92971892 | 1100 |
| 68.94671892 | 1105.486 |
| 68.96371892 | 1137.41 |
| 68.98071892 | 1068.37 |
| 68.99771892 | 1078.304 |
| 69.01471892 | 1105.187 |
| 69.03171892 | 1135.641 |
| 69.04871892 | 1105.476 |
| 69.06571892 | 1121.521 |
| 69.08271892 | 1178.48 |
| 69.09971892 | 1063.72 |
| 69.11671892 | 1144.017 |
| 69.13371892 | 1131.753 |
| 69.15071892 | 1173.268 |
| 69.16771892 | 1189.912 |
| 69.18471892 | 1254.548 |
| 69.20171892 | 1203.661 |
| 69.21871892 | 1172.866 |
| 69.23571892 | 1236.79 |
| 69.25271892 | 1235.479 |
| 69.26971892 | 1279.883 |
| 69.28671892 | 1327.899 |
| 69.30371892 | 1355.543 |
| 69.32071892 | 1333.801 |
| 69.33771892 | 1350.604 |
| 69.35471892 | 1437.061 |
| 69.37171892 | 1496.483 |
| 69.38871892 | 1561.785 |
| 69.40571892 | 1630.912 |
| 69.42271892 | 1666.394 |
| 69.43971892 | 1669.583 |
| 69.45671892 | 1669.94 |
| 69.47371892 | 1715.074 |
| 69.49071892 | 1662.04 |
| 69.50771892 | 1632.742 |
| 69.52471892 | 1613.223 |
| 69.54171892 | 1556.889 |
| 69.55871892 | 1596.726 |
| 69.57571892 | 1614.485 |
| 69.59271892 | 1591.639 |
| 69.60971892 | 1566.153 |
| 69.62671892 | 1563.439 |
| 69.64371892 | 1495.111 |
| 69.66071892 | 1447.749 |
| 69.67771892 | 1472.281 |
| 69.69471892 | 1372.37 |
| 69.71171892 | 1445.035 |
| 69.72871892 | 1366.685 |
| 69.74571892 | 1397.886 |
| 69.76271892 | 1346.655 |
| 69.77971892 | 1277.019 |
| 69.79671892 | 1335.33 |
| 69.81371892 | 1278.089 |
| 69.83071892 | 1178.142 |
| 69.84771892 | 1262.088 |
| 69.86471892 | 1246.148 |
| 69.88171892 | 1271.298 |
| 69.89871892 | 1242.082 |
| 69.91571892 | 1368.385 |
| 69.93271892 | 1380.966 |
| 69.94971892 | 1330.282 |
| 69.96671892 | 1294.102 |
| 69.98371892 | 1276.015 |